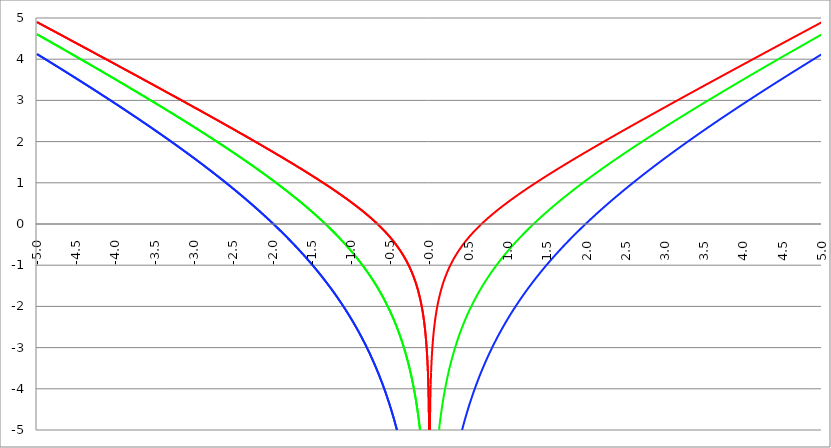
| Category | Series 1 | Series 0 | Series 2 |
|---|---|---|---|
| -5.0 | 4.9 | 4.605 | 4.124 |
| -4.995 | 4.895 | 4.6 | 4.119 |
| -4.99 | 4.89 | 4.594 | 4.113 |
| -4.985 | 4.885 | 4.589 | 4.107 |
| -4.98 | 4.88 | 4.584 | 4.101 |
| -4.975 | 4.875 | 4.578 | 4.095 |
| -4.97 | 4.87 | 4.573 | 4.089 |
| -4.965000000000001 | 4.865 | 4.567 | 4.084 |
| -4.960000000000001 | 4.86 | 4.562 | 4.078 |
| -4.955000000000001 | 4.854 | 4.557 | 4.072 |
| -4.950000000000001 | 4.849 | 4.551 | 4.066 |
| -4.945000000000001 | 4.844 | 4.546 | 4.06 |
| -4.940000000000001 | 4.839 | 4.54 | 4.054 |
| -4.935000000000001 | 4.834 | 4.535 | 4.049 |
| -4.930000000000001 | 4.829 | 4.53 | 4.043 |
| -4.925000000000002 | 4.824 | 4.524 | 4.037 |
| -4.920000000000002 | 4.819 | 4.519 | 4.031 |
| -4.915000000000002 | 4.814 | 4.513 | 4.025 |
| -4.910000000000002 | 4.809 | 4.508 | 4.019 |
| -4.905000000000002 | 4.803 | 4.503 | 4.013 |
| -4.900000000000002 | 4.798 | 4.497 | 4.008 |
| -4.895000000000002 | 4.793 | 4.492 | 4.002 |
| -4.890000000000002 | 4.788 | 4.486 | 3.996 |
| -4.885000000000002 | 4.783 | 4.481 | 3.99 |
| -4.880000000000002 | 4.778 | 4.476 | 3.984 |
| -4.875000000000003 | 4.773 | 4.47 | 3.978 |
| -4.870000000000003 | 4.768 | 4.465 | 3.972 |
| -4.865000000000003 | 4.763 | 4.459 | 3.966 |
| -4.860000000000003 | 4.757 | 4.454 | 3.961 |
| -4.855000000000003 | 4.752 | 4.449 | 3.955 |
| -4.850000000000003 | 4.747 | 4.443 | 3.949 |
| -4.845000000000003 | 4.742 | 4.438 | 3.943 |
| -4.840000000000003 | 4.737 | 4.432 | 3.937 |
| -4.835000000000003 | 4.732 | 4.427 | 3.931 |
| -4.830000000000004 | 4.727 | 4.422 | 3.925 |
| -4.825000000000004 | 4.722 | 4.416 | 3.919 |
| -4.820000000000004 | 4.717 | 4.411 | 3.914 |
| -4.815000000000004 | 4.712 | 4.405 | 3.908 |
| -4.810000000000004 | 4.706 | 4.4 | 3.902 |
| -4.805000000000004 | 4.701 | 4.394 | 3.896 |
| -4.800000000000004 | 4.696 | 4.389 | 3.89 |
| -4.795000000000004 | 4.691 | 4.384 | 3.884 |
| -4.790000000000004 | 4.686 | 4.378 | 3.878 |
| -4.785000000000004 | 4.681 | 4.373 | 3.872 |
| -4.780000000000004 | 4.676 | 4.367 | 3.866 |
| -4.775000000000004 | 4.671 | 4.362 | 3.86 |
| -4.770000000000004 | 4.666 | 4.357 | 3.855 |
| -4.765000000000005 | 4.66 | 4.351 | 3.849 |
| -4.760000000000005 | 4.655 | 4.346 | 3.843 |
| -4.755000000000005 | 4.65 | 4.34 | 3.837 |
| -4.750000000000005 | 4.645 | 4.335 | 3.831 |
| -4.745000000000005 | 4.64 | 4.329 | 3.825 |
| -4.740000000000005 | 4.635 | 4.324 | 3.819 |
| -4.735000000000005 | 4.63 | 4.319 | 3.813 |
| -4.730000000000005 | 4.625 | 4.313 | 3.807 |
| -4.725000000000006 | 4.62 | 4.308 | 3.801 |
| -4.720000000000006 | 4.614 | 4.302 | 3.795 |
| -4.715000000000006 | 4.609 | 4.297 | 3.789 |
| -4.710000000000006 | 4.604 | 4.291 | 3.784 |
| -4.705000000000006 | 4.599 | 4.286 | 3.778 |
| -4.700000000000006 | 4.594 | 4.281 | 3.772 |
| -4.695000000000006 | 4.589 | 4.275 | 3.766 |
| -4.690000000000006 | 4.584 | 4.27 | 3.76 |
| -4.685000000000007 | 4.579 | 4.264 | 3.754 |
| -4.680000000000007 | 4.574 | 4.259 | 3.748 |
| -4.675000000000007 | 4.568 | 4.253 | 3.742 |
| -4.670000000000007 | 4.563 | 4.248 | 3.736 |
| -4.665000000000007 | 4.558 | 4.243 | 3.73 |
| -4.660000000000007 | 4.553 | 4.237 | 3.724 |
| -4.655000000000007 | 4.548 | 4.232 | 3.718 |
| -4.650000000000007 | 4.543 | 4.226 | 3.712 |
| -4.645000000000007 | 4.538 | 4.221 | 3.706 |
| -4.640000000000008 | 4.533 | 4.215 | 3.7 |
| -4.635000000000008 | 4.528 | 4.21 | 3.694 |
| -4.630000000000008 | 4.522 | 4.204 | 3.688 |
| -4.625000000000008 | 4.517 | 4.199 | 3.682 |
| -4.620000000000008 | 4.512 | 4.194 | 3.677 |
| -4.615000000000008 | 4.507 | 4.188 | 3.671 |
| -4.610000000000008 | 4.502 | 4.183 | 3.665 |
| -4.605000000000008 | 4.497 | 4.177 | 3.659 |
| -4.600000000000008 | 4.492 | 4.172 | 3.653 |
| -4.595000000000009 | 4.487 | 4.166 | 3.647 |
| -4.590000000000009 | 4.481 | 4.161 | 3.641 |
| -4.585000000000009 | 4.476 | 4.155 | 3.635 |
| -4.580000000000009 | 4.471 | 4.15 | 3.629 |
| -4.57500000000001 | 4.466 | 4.144 | 3.623 |
| -4.57000000000001 | 4.461 | 4.139 | 3.617 |
| -4.565000000000009 | 4.456 | 4.134 | 3.611 |
| -4.560000000000009 | 4.451 | 4.128 | 3.605 |
| -4.555000000000009 | 4.446 | 4.123 | 3.599 |
| -4.55000000000001 | 4.441 | 4.117 | 3.593 |
| -4.54500000000001 | 4.435 | 4.112 | 3.587 |
| -4.54000000000001 | 4.43 | 4.106 | 3.581 |
| -4.53500000000001 | 4.425 | 4.101 | 3.575 |
| -4.53000000000001 | 4.42 | 4.095 | 3.569 |
| -4.52500000000001 | 4.415 | 4.09 | 3.563 |
| -4.52000000000001 | 4.41 | 4.084 | 3.557 |
| -4.51500000000001 | 4.405 | 4.079 | 3.551 |
| -4.51000000000001 | 4.4 | 4.073 | 3.545 |
| -4.505000000000011 | 4.394 | 4.068 | 3.539 |
| -4.500000000000011 | 4.389 | 4.062 | 3.533 |
| -4.495000000000011 | 4.384 | 4.057 | 3.527 |
| -4.490000000000011 | 4.379 | 4.052 | 3.521 |
| -4.485000000000011 | 4.374 | 4.046 | 3.515 |
| -4.480000000000011 | 4.369 | 4.041 | 3.509 |
| -4.475000000000011 | 4.364 | 4.035 | 3.503 |
| -4.470000000000011 | 4.359 | 4.03 | 3.497 |
| -4.465000000000011 | 4.353 | 4.024 | 3.491 |
| -4.460000000000011 | 4.348 | 4.019 | 3.485 |
| -4.455000000000012 | 4.343 | 4.013 | 3.479 |
| -4.450000000000012 | 4.338 | 4.008 | 3.473 |
| -4.445000000000012 | 4.333 | 4.002 | 3.467 |
| -4.440000000000012 | 4.328 | 3.997 | 3.461 |
| -4.435000000000012 | 4.323 | 3.991 | 3.455 |
| -4.430000000000012 | 4.318 | 3.986 | 3.449 |
| -4.425000000000012 | 4.312 | 3.98 | 3.443 |
| -4.420000000000012 | 4.307 | 3.975 | 3.436 |
| -4.415000000000012 | 4.302 | 3.969 | 3.43 |
| -4.410000000000013 | 4.297 | 3.964 | 3.424 |
| -4.405000000000013 | 4.292 | 3.958 | 3.418 |
| -4.400000000000013 | 4.287 | 3.953 | 3.412 |
| -4.395000000000013 | 4.282 | 3.947 | 3.406 |
| -4.390000000000013 | 4.277 | 3.942 | 3.4 |
| -4.385000000000013 | 4.271 | 3.936 | 3.394 |
| -4.380000000000013 | 4.266 | 3.931 | 3.388 |
| -4.375000000000013 | 4.261 | 3.925 | 3.382 |
| -4.370000000000013 | 4.256 | 3.92 | 3.376 |
| -4.365000000000013 | 4.251 | 3.914 | 3.37 |
| -4.360000000000014 | 4.246 | 3.909 | 3.364 |
| -4.355000000000014 | 4.241 | 3.903 | 3.358 |
| -4.350000000000014 | 4.236 | 3.898 | 3.352 |
| -4.345000000000014 | 4.23 | 3.892 | 3.346 |
| -4.340000000000014 | 4.225 | 3.887 | 3.34 |
| -4.335000000000014 | 4.22 | 3.881 | 3.333 |
| -4.330000000000014 | 4.215 | 3.876 | 3.327 |
| -4.325000000000014 | 4.21 | 3.87 | 3.321 |
| -4.320000000000014 | 4.205 | 3.865 | 3.315 |
| -4.315000000000015 | 4.2 | 3.859 | 3.309 |
| -4.310000000000015 | 4.195 | 3.854 | 3.303 |
| -4.305000000000015 | 4.189 | 3.848 | 3.297 |
| -4.300000000000015 | 4.184 | 3.843 | 3.291 |
| -4.295000000000015 | 4.179 | 3.837 | 3.285 |
| -4.290000000000015 | 4.174 | 3.832 | 3.279 |
| -4.285000000000015 | 4.169 | 3.826 | 3.273 |
| -4.280000000000015 | 4.164 | 3.821 | 3.266 |
| -4.275000000000015 | 4.159 | 3.815 | 3.26 |
| -4.270000000000015 | 4.153 | 3.81 | 3.254 |
| -4.265000000000016 | 4.148 | 3.804 | 3.248 |
| -4.260000000000016 | 4.143 | 3.799 | 3.242 |
| -4.255000000000016 | 4.138 | 3.793 | 3.236 |
| -4.250000000000016 | 4.133 | 3.788 | 3.23 |
| -4.245000000000016 | 4.128 | 3.782 | 3.224 |
| -4.240000000000016 | 4.123 | 3.777 | 3.217 |
| -4.235000000000016 | 4.117 | 3.771 | 3.211 |
| -4.230000000000016 | 4.112 | 3.765 | 3.205 |
| -4.225000000000017 | 4.107 | 3.76 | 3.199 |
| -4.220000000000017 | 4.102 | 3.754 | 3.193 |
| -4.215000000000017 | 4.097 | 3.749 | 3.187 |
| -4.210000000000017 | 4.092 | 3.743 | 3.181 |
| -4.205000000000017 | 4.087 | 3.738 | 3.175 |
| -4.200000000000017 | 4.082 | 3.732 | 3.168 |
| -4.195000000000017 | 4.076 | 3.727 | 3.162 |
| -4.190000000000017 | 4.071 | 3.721 | 3.156 |
| -4.185000000000017 | 4.066 | 3.716 | 3.15 |
| -4.180000000000017 | 4.061 | 3.71 | 3.144 |
| -4.175000000000018 | 4.056 | 3.705 | 3.138 |
| -4.170000000000018 | 4.051 | 3.699 | 3.131 |
| -4.165000000000018 | 4.046 | 3.693 | 3.125 |
| -4.160000000000018 | 4.04 | 3.688 | 3.119 |
| -4.155000000000018 | 4.035 | 3.682 | 3.113 |
| -4.150000000000018 | 4.03 | 3.677 | 3.107 |
| -4.145000000000018 | 4.025 | 3.671 | 3.101 |
| -4.140000000000018 | 4.02 | 3.666 | 3.094 |
| -4.135000000000018 | 4.015 | 3.66 | 3.088 |
| -4.130000000000019 | 4.01 | 3.655 | 3.082 |
| -4.125000000000019 | 4.004 | 3.649 | 3.076 |
| -4.120000000000019 | 3.999 | 3.643 | 3.07 |
| -4.115000000000019 | 3.994 | 3.638 | 3.064 |
| -4.110000000000019 | 3.989 | 3.632 | 3.057 |
| -4.105000000000019 | 3.984 | 3.627 | 3.051 |
| -4.100000000000019 | 3.979 | 3.621 | 3.045 |
| -4.095000000000019 | 3.973 | 3.616 | 3.039 |
| -4.090000000000019 | 3.968 | 3.61 | 3.033 |
| -4.085000000000019 | 3.963 | 3.605 | 3.026 |
| -4.08000000000002 | 3.958 | 3.599 | 3.02 |
| -4.07500000000002 | 3.953 | 3.593 | 3.014 |
| -4.07000000000002 | 3.948 | 3.588 | 3.008 |
| -4.06500000000002 | 3.943 | 3.582 | 3.002 |
| -4.06000000000002 | 3.937 | 3.577 | 2.995 |
| -4.05500000000002 | 3.932 | 3.571 | 2.989 |
| -4.05000000000002 | 3.927 | 3.566 | 2.983 |
| -4.04500000000002 | 3.922 | 3.56 | 2.977 |
| -4.04000000000002 | 3.917 | 3.554 | 2.97 |
| -4.03500000000002 | 3.912 | 3.549 | 2.964 |
| -4.03000000000002 | 3.907 | 3.543 | 2.958 |
| -4.025000000000021 | 3.901 | 3.538 | 2.952 |
| -4.020000000000021 | 3.896 | 3.532 | 2.946 |
| -4.015000000000021 | 3.891 | 3.526 | 2.939 |
| -4.010000000000021 | 3.886 | 3.521 | 2.933 |
| -4.005000000000021 | 3.881 | 3.515 | 2.927 |
| -4.000000000000021 | 3.876 | 3.51 | 2.921 |
| -3.995000000000021 | 3.87 | 3.504 | 2.914 |
| -3.990000000000021 | 3.865 | 3.499 | 2.908 |
| -3.985000000000022 | 3.86 | 3.493 | 2.902 |
| -3.980000000000022 | 3.855 | 3.487 | 2.896 |
| -3.975000000000022 | 3.85 | 3.482 | 2.889 |
| -3.970000000000022 | 3.845 | 3.476 | 2.883 |
| -3.965000000000022 | 3.84 | 3.471 | 2.877 |
| -3.960000000000022 | 3.834 | 3.465 | 2.87 |
| -3.955000000000022 | 3.829 | 3.459 | 2.864 |
| -3.950000000000022 | 3.824 | 3.454 | 2.858 |
| -3.945000000000022 | 3.819 | 3.448 | 2.852 |
| -3.940000000000023 | 3.814 | 3.443 | 2.845 |
| -3.935000000000023 | 3.809 | 3.437 | 2.839 |
| -3.930000000000023 | 3.803 | 3.431 | 2.833 |
| -3.925000000000023 | 3.798 | 3.426 | 2.826 |
| -3.920000000000023 | 3.793 | 3.42 | 2.82 |
| -3.915000000000023 | 3.788 | 3.414 | 2.814 |
| -3.910000000000023 | 3.783 | 3.409 | 2.808 |
| -3.905000000000023 | 3.778 | 3.403 | 2.801 |
| -3.900000000000023 | 3.772 | 3.398 | 2.795 |
| -3.895000000000023 | 3.767 | 3.392 | 2.789 |
| -3.890000000000024 | 3.762 | 3.386 | 2.782 |
| -3.885000000000024 | 3.757 | 3.381 | 2.776 |
| -3.880000000000024 | 3.752 | 3.375 | 2.77 |
| -3.875000000000024 | 3.747 | 3.37 | 2.763 |
| -3.870000000000024 | 3.742 | 3.364 | 2.757 |
| -3.865000000000024 | 3.736 | 3.358 | 2.751 |
| -3.860000000000024 | 3.731 | 3.353 | 2.744 |
| -3.855000000000024 | 3.726 | 3.347 | 2.738 |
| -3.850000000000024 | 3.721 | 3.341 | 2.732 |
| -3.845000000000025 | 3.716 | 3.336 | 2.725 |
| -3.840000000000025 | 3.711 | 3.33 | 2.719 |
| -3.835000000000025 | 3.705 | 3.324 | 2.713 |
| -3.830000000000025 | 3.7 | 3.319 | 2.706 |
| -3.825000000000025 | 3.695 | 3.313 | 2.7 |
| -3.820000000000025 | 3.69 | 3.308 | 2.694 |
| -3.815000000000025 | 3.685 | 3.302 | 2.687 |
| -3.810000000000025 | 3.68 | 3.296 | 2.681 |
| -3.805000000000025 | 3.674 | 3.291 | 2.675 |
| -3.800000000000026 | 3.669 | 3.285 | 2.668 |
| -3.795000000000026 | 3.664 | 3.279 | 2.662 |
| -3.790000000000026 | 3.659 | 3.274 | 2.655 |
| -3.785000000000026 | 3.654 | 3.268 | 2.649 |
| -3.780000000000026 | 3.648 | 3.262 | 2.643 |
| -3.775000000000026 | 3.643 | 3.257 | 2.636 |
| -3.770000000000026 | 3.638 | 3.251 | 2.63 |
| -3.765000000000026 | 3.633 | 3.245 | 2.624 |
| -3.760000000000026 | 3.628 | 3.24 | 2.617 |
| -3.755000000000026 | 3.623 | 3.234 | 2.611 |
| -3.750000000000027 | 3.617 | 3.228 | 2.604 |
| -3.745000000000027 | 3.612 | 3.223 | 2.598 |
| -3.740000000000027 | 3.607 | 3.217 | 2.592 |
| -3.735000000000027 | 3.602 | 3.211 | 2.585 |
| -3.730000000000027 | 3.597 | 3.206 | 2.579 |
| -3.725000000000027 | 3.592 | 3.2 | 2.572 |
| -3.720000000000027 | 3.586 | 3.194 | 2.566 |
| -3.715000000000027 | 3.581 | 3.189 | 2.559 |
| -3.710000000000027 | 3.576 | 3.183 | 2.553 |
| -3.705000000000028 | 3.571 | 3.177 | 2.547 |
| -3.700000000000028 | 3.566 | 3.172 | 2.54 |
| -3.695000000000028 | 3.56 | 3.166 | 2.534 |
| -3.690000000000028 | 3.555 | 3.16 | 2.527 |
| -3.685000000000028 | 3.55 | 3.155 | 2.521 |
| -3.680000000000028 | 3.545 | 3.149 | 2.514 |
| -3.675000000000028 | 3.54 | 3.143 | 2.508 |
| -3.670000000000028 | 3.535 | 3.137 | 2.501 |
| -3.665000000000028 | 3.529 | 3.132 | 2.495 |
| -3.660000000000028 | 3.524 | 3.126 | 2.489 |
| -3.655000000000029 | 3.519 | 3.12 | 2.482 |
| -3.650000000000029 | 3.514 | 3.115 | 2.476 |
| -3.645000000000029 | 3.509 | 3.109 | 2.469 |
| -3.640000000000029 | 3.503 | 3.103 | 2.463 |
| -3.635000000000029 | 3.498 | 3.098 | 2.456 |
| -3.630000000000029 | 3.493 | 3.092 | 2.45 |
| -3.625000000000029 | 3.488 | 3.086 | 2.443 |
| -3.620000000000029 | 3.483 | 3.08 | 2.437 |
| -3.615000000000029 | 3.478 | 3.075 | 2.43 |
| -3.61000000000003 | 3.472 | 3.069 | 2.424 |
| -3.60500000000003 | 3.467 | 3.063 | 2.417 |
| -3.60000000000003 | 3.462 | 3.058 | 2.411 |
| -3.59500000000003 | 3.457 | 3.052 | 2.404 |
| -3.59000000000003 | 3.452 | 3.046 | 2.398 |
| -3.58500000000003 | 3.446 | 3.04 | 2.391 |
| -3.58000000000003 | 3.441 | 3.035 | 2.385 |
| -3.57500000000003 | 3.436 | 3.029 | 2.378 |
| -3.57000000000003 | 3.431 | 3.023 | 2.372 |
| -3.565000000000031 | 3.426 | 3.017 | 2.365 |
| -3.560000000000031 | 3.42 | 3.012 | 2.359 |
| -3.555000000000031 | 3.415 | 3.006 | 2.352 |
| -3.550000000000031 | 3.41 | 3 | 2.345 |
| -3.545000000000031 | 3.405 | 2.995 | 2.339 |
| -3.540000000000031 | 3.4 | 2.989 | 2.332 |
| -3.535000000000031 | 3.394 | 2.983 | 2.326 |
| -3.530000000000031 | 3.389 | 2.977 | 2.319 |
| -3.525000000000031 | 3.384 | 2.972 | 2.313 |
| -3.520000000000032 | 3.379 | 2.966 | 2.306 |
| -3.515000000000032 | 3.374 | 2.96 | 2.299 |
| -3.510000000000032 | 3.368 | 2.954 | 2.293 |
| -3.505000000000032 | 3.363 | 2.949 | 2.286 |
| -3.500000000000032 | 3.358 | 2.943 | 2.28 |
| -3.495000000000032 | 3.353 | 2.937 | 2.273 |
| -3.490000000000032 | 3.348 | 2.931 | 2.267 |
| -3.485000000000032 | 3.342 | 2.926 | 2.26 |
| -3.480000000000032 | 3.337 | 2.92 | 2.253 |
| -3.475000000000032 | 3.332 | 2.914 | 2.247 |
| -3.470000000000033 | 3.327 | 2.908 | 2.24 |
| -3.465000000000033 | 3.322 | 2.902 | 2.234 |
| -3.460000000000033 | 3.316 | 2.897 | 2.227 |
| -3.455000000000033 | 3.311 | 2.891 | 2.22 |
| -3.450000000000033 | 3.306 | 2.885 | 2.214 |
| -3.445000000000033 | 3.301 | 2.879 | 2.207 |
| -3.440000000000033 | 3.296 | 2.874 | 2.2 |
| -3.435000000000033 | 3.29 | 2.868 | 2.194 |
| -3.430000000000033 | 3.285 | 2.862 | 2.187 |
| -3.425000000000034 | 3.28 | 2.856 | 2.181 |
| -3.420000000000034 | 3.275 | 2.85 | 2.174 |
| -3.415000000000034 | 3.27 | 2.845 | 2.167 |
| -3.410000000000034 | 3.264 | 2.839 | 2.161 |
| -3.405000000000034 | 3.259 | 2.833 | 2.154 |
| -3.400000000000034 | 3.254 | 2.827 | 2.147 |
| -3.395000000000034 | 3.249 | 2.821 | 2.141 |
| -3.390000000000034 | 3.244 | 2.816 | 2.134 |
| -3.385000000000034 | 3.238 | 2.81 | 2.127 |
| -3.380000000000034 | 3.233 | 2.804 | 2.121 |
| -3.375000000000035 | 3.228 | 2.798 | 2.114 |
| -3.370000000000035 | 3.223 | 2.792 | 2.107 |
| -3.365000000000035 | 3.217 | 2.787 | 2.1 |
| -3.360000000000035 | 3.212 | 2.781 | 2.094 |
| -3.355000000000035 | 3.207 | 2.775 | 2.087 |
| -3.350000000000035 | 3.202 | 2.769 | 2.08 |
| -3.345000000000035 | 3.197 | 2.763 | 2.074 |
| -3.340000000000035 | 3.191 | 2.757 | 2.067 |
| -3.335000000000035 | 3.186 | 2.752 | 2.06 |
| -3.330000000000036 | 3.181 | 2.746 | 2.053 |
| -3.325000000000036 | 3.176 | 2.74 | 2.047 |
| -3.320000000000036 | 3.171 | 2.734 | 2.04 |
| -3.315000000000036 | 3.165 | 2.728 | 2.033 |
| -3.310000000000036 | 3.16 | 2.722 | 2.026 |
| -3.305000000000036 | 3.155 | 2.717 | 2.02 |
| -3.300000000000036 | 3.15 | 2.711 | 2.013 |
| -3.295000000000036 | 3.144 | 2.705 | 2.006 |
| -3.290000000000036 | 3.139 | 2.699 | 1.999 |
| -3.285000000000036 | 3.134 | 2.693 | 1.993 |
| -3.280000000000036 | 3.129 | 2.687 | 1.986 |
| -3.275000000000037 | 3.123 | 2.681 | 1.979 |
| -3.270000000000037 | 3.118 | 2.676 | 1.972 |
| -3.265000000000037 | 3.113 | 2.67 | 1.966 |
| -3.260000000000037 | 3.108 | 2.664 | 1.959 |
| -3.255000000000037 | 3.103 | 2.658 | 1.952 |
| -3.250000000000037 | 3.097 | 2.652 | 1.945 |
| -3.245000000000037 | 3.092 | 2.646 | 1.938 |
| -3.240000000000037 | 3.087 | 2.64 | 1.932 |
| -3.235000000000038 | 3.082 | 2.635 | 1.925 |
| -3.230000000000038 | 3.076 | 2.629 | 1.918 |
| -3.225000000000038 | 3.071 | 2.623 | 1.911 |
| -3.220000000000038 | 3.066 | 2.617 | 1.904 |
| -3.215000000000038 | 3.061 | 2.611 | 1.897 |
| -3.210000000000038 | 3.055 | 2.605 | 1.891 |
| -3.205000000000038 | 3.05 | 2.599 | 1.884 |
| -3.200000000000038 | 3.045 | 2.593 | 1.877 |
| -3.195000000000038 | 3.04 | 2.587 | 1.87 |
| -3.190000000000039 | 3.035 | 2.582 | 1.863 |
| -3.185000000000039 | 3.029 | 2.576 | 1.856 |
| -3.180000000000039 | 3.024 | 2.57 | 1.849 |
| -3.175000000000039 | 3.019 | 2.564 | 1.843 |
| -3.170000000000039 | 3.014 | 2.558 | 1.836 |
| -3.16500000000004 | 3.008 | 2.552 | 1.829 |
| -3.16000000000004 | 3.003 | 2.546 | 1.822 |
| -3.155000000000039 | 2.998 | 2.54 | 1.815 |
| -3.150000000000039 | 2.993 | 2.534 | 1.808 |
| -3.14500000000004 | 2.987 | 2.528 | 1.801 |
| -3.14000000000004 | 2.982 | 2.522 | 1.794 |
| -3.13500000000004 | 2.977 | 2.516 | 1.787 |
| -3.13000000000004 | 2.972 | 2.51 | 1.78 |
| -3.12500000000004 | 2.966 | 2.505 | 1.774 |
| -3.12000000000004 | 2.961 | 2.499 | 1.767 |
| -3.11500000000004 | 2.956 | 2.493 | 1.76 |
| -3.11000000000004 | 2.951 | 2.487 | 1.753 |
| -3.10500000000004 | 2.945 | 2.481 | 1.746 |
| -3.10000000000004 | 2.94 | 2.475 | 1.739 |
| -3.095000000000041 | 2.935 | 2.469 | 1.732 |
| -3.090000000000041 | 2.93 | 2.463 | 1.725 |
| -3.085000000000041 | 2.924 | 2.457 | 1.718 |
| -3.080000000000041 | 2.919 | 2.451 | 1.711 |
| -3.075000000000041 | 2.914 | 2.445 | 1.704 |
| -3.070000000000041 | 2.909 | 2.439 | 1.697 |
| -3.065000000000041 | 2.903 | 2.433 | 1.69 |
| -3.060000000000041 | 2.898 | 2.427 | 1.683 |
| -3.055000000000041 | 2.893 | 2.421 | 1.676 |
| -3.050000000000042 | 2.887 | 2.415 | 1.669 |
| -3.045000000000042 | 2.882 | 2.409 | 1.662 |
| -3.040000000000042 | 2.877 | 2.403 | 1.655 |
| -3.035000000000042 | 2.872 | 2.397 | 1.648 |
| -3.030000000000042 | 2.866 | 2.391 | 1.641 |
| -3.025000000000042 | 2.861 | 2.385 | 1.634 |
| -3.020000000000042 | 2.856 | 2.379 | 1.627 |
| -3.015000000000042 | 2.851 | 2.373 | 1.62 |
| -3.010000000000042 | 2.845 | 2.367 | 1.613 |
| -3.005000000000043 | 2.84 | 2.361 | 1.606 |
| -3.000000000000043 | 2.835 | 2.355 | 1.599 |
| -2.995000000000043 | 2.83 | 2.349 | 1.591 |
| -2.990000000000043 | 2.824 | 2.343 | 1.584 |
| -2.985000000000043 | 2.819 | 2.337 | 1.577 |
| -2.980000000000043 | 2.814 | 2.331 | 1.57 |
| -2.975000000000043 | 2.808 | 2.325 | 1.563 |
| -2.970000000000043 | 2.803 | 2.319 | 1.556 |
| -2.965000000000043 | 2.798 | 2.313 | 1.549 |
| -2.960000000000043 | 2.793 | 2.307 | 1.542 |
| -2.955000000000044 | 2.787 | 2.301 | 1.535 |
| -2.950000000000044 | 2.782 | 2.295 | 1.528 |
| -2.945000000000044 | 2.777 | 2.289 | 1.52 |
| -2.940000000000044 | 2.772 | 2.283 | 1.513 |
| -2.935000000000044 | 2.766 | 2.277 | 1.506 |
| -2.930000000000044 | 2.761 | 2.271 | 1.499 |
| -2.925000000000044 | 2.756 | 2.265 | 1.492 |
| -2.920000000000044 | 2.75 | 2.259 | 1.485 |
| -2.915000000000044 | 2.745 | 2.253 | 1.477 |
| -2.910000000000045 | 2.74 | 2.247 | 1.47 |
| -2.905000000000045 | 2.735 | 2.241 | 1.463 |
| -2.900000000000045 | 2.729 | 2.234 | 1.456 |
| -2.895000000000045 | 2.724 | 2.228 | 1.449 |
| -2.890000000000045 | 2.719 | 2.222 | 1.441 |
| -2.885000000000045 | 2.713 | 2.216 | 1.434 |
| -2.880000000000045 | 2.708 | 2.21 | 1.427 |
| -2.875000000000045 | 2.703 | 2.204 | 1.42 |
| -2.870000000000045 | 2.697 | 2.198 | 1.413 |
| -2.865000000000045 | 2.692 | 2.192 | 1.405 |
| -2.860000000000046 | 2.687 | 2.186 | 1.398 |
| -2.855000000000046 | 2.682 | 2.18 | 1.391 |
| -2.850000000000046 | 2.676 | 2.174 | 1.384 |
| -2.845000000000046 | 2.671 | 2.167 | 1.376 |
| -2.840000000000046 | 2.666 | 2.161 | 1.369 |
| -2.835000000000046 | 2.66 | 2.155 | 1.362 |
| -2.830000000000046 | 2.655 | 2.149 | 1.355 |
| -2.825000000000046 | 2.65 | 2.143 | 1.347 |
| -2.820000000000046 | 2.644 | 2.137 | 1.34 |
| -2.815000000000047 | 2.639 | 2.131 | 1.333 |
| -2.810000000000047 | 2.634 | 2.125 | 1.325 |
| -2.805000000000047 | 2.629 | 2.118 | 1.318 |
| -2.800000000000047 | 2.623 | 2.112 | 1.311 |
| -2.795000000000047 | 2.618 | 2.106 | 1.303 |
| -2.790000000000047 | 2.613 | 2.1 | 1.296 |
| -2.785000000000047 | 2.607 | 2.094 | 1.289 |
| -2.780000000000047 | 2.602 | 2.088 | 1.281 |
| -2.775000000000047 | 2.597 | 2.081 | 1.274 |
| -2.770000000000047 | 2.591 | 2.075 | 1.267 |
| -2.765000000000048 | 2.586 | 2.069 | 1.259 |
| -2.760000000000048 | 2.581 | 2.063 | 1.252 |
| -2.755000000000048 | 2.575 | 2.057 | 1.244 |
| -2.750000000000048 | 2.57 | 2.051 | 1.237 |
| -2.745000000000048 | 2.565 | 2.044 | 1.23 |
| -2.740000000000048 | 2.559 | 2.038 | 1.222 |
| -2.735000000000048 | 2.554 | 2.032 | 1.215 |
| -2.730000000000048 | 2.549 | 2.026 | 1.207 |
| -2.725000000000048 | 2.543 | 2.02 | 1.2 |
| -2.720000000000049 | 2.538 | 2.013 | 1.193 |
| -2.715000000000049 | 2.533 | 2.007 | 1.185 |
| -2.710000000000049 | 2.528 | 2.001 | 1.178 |
| -2.705000000000049 | 2.522 | 1.995 | 1.17 |
| -2.700000000000049 | 2.517 | 1.989 | 1.163 |
| -2.695000000000049 | 2.512 | 1.982 | 1.155 |
| -2.690000000000049 | 2.506 | 1.976 | 1.148 |
| -2.685000000000049 | 2.501 | 1.97 | 1.14 |
| -2.680000000000049 | 2.496 | 1.964 | 1.133 |
| -2.675000000000049 | 2.49 | 1.957 | 1.125 |
| -2.67000000000005 | 2.485 | 1.951 | 1.118 |
| -2.66500000000005 | 2.479 | 1.945 | 1.11 |
| -2.66000000000005 | 2.474 | 1.939 | 1.103 |
| -2.65500000000005 | 2.469 | 1.932 | 1.095 |
| -2.65000000000005 | 2.463 | 1.926 | 1.088 |
| -2.64500000000005 | 2.458 | 1.92 | 1.08 |
| -2.64000000000005 | 2.453 | 1.914 | 1.072 |
| -2.63500000000005 | 2.447 | 1.907 | 1.065 |
| -2.63000000000005 | 2.442 | 1.901 | 1.057 |
| -2.625000000000051 | 2.437 | 1.895 | 1.05 |
| -2.620000000000051 | 2.431 | 1.889 | 1.042 |
| -2.615000000000051 | 2.426 | 1.882 | 1.034 |
| -2.610000000000051 | 2.421 | 1.876 | 1.027 |
| -2.605000000000051 | 2.415 | 1.87 | 1.019 |
| -2.600000000000051 | 2.41 | 1.863 | 1.012 |
| -2.595000000000051 | 2.405 | 1.857 | 1.004 |
| -2.590000000000051 | 2.399 | 1.851 | 0.996 |
| -2.585000000000051 | 2.394 | 1.844 | 0.989 |
| -2.580000000000052 | 2.389 | 1.838 | 0.981 |
| -2.575000000000052 | 2.383 | 1.832 | 0.973 |
| -2.570000000000052 | 2.378 | 1.825 | 0.966 |
| -2.565000000000052 | 2.372 | 1.819 | 0.958 |
| -2.560000000000052 | 2.367 | 1.813 | 0.95 |
| -2.555000000000052 | 2.362 | 1.806 | 0.943 |
| -2.550000000000052 | 2.356 | 1.8 | 0.935 |
| -2.545000000000052 | 2.351 | 1.794 | 0.927 |
| -2.540000000000052 | 2.346 | 1.787 | 0.919 |
| -2.535000000000053 | 2.34 | 1.781 | 0.912 |
| -2.530000000000053 | 2.335 | 1.775 | 0.904 |
| -2.525000000000053 | 2.329 | 1.768 | 0.896 |
| -2.520000000000053 | 2.324 | 1.762 | 0.888 |
| -2.515000000000053 | 2.319 | 1.755 | 0.881 |
| -2.510000000000053 | 2.313 | 1.749 | 0.873 |
| -2.505000000000053 | 2.308 | 1.743 | 0.865 |
| -2.500000000000053 | 2.303 | 1.736 | 0.857 |
| -2.495000000000053 | 2.297 | 1.73 | 0.849 |
| -2.490000000000053 | 2.292 | 1.723 | 0.842 |
| -2.485000000000054 | 2.286 | 1.717 | 0.834 |
| -2.480000000000054 | 2.281 | 1.711 | 0.826 |
| -2.475000000000054 | 2.276 | 1.704 | 0.818 |
| -2.470000000000054 | 2.27 | 1.698 | 0.81 |
| -2.465000000000054 | 2.265 | 1.691 | 0.802 |
| -2.460000000000054 | 2.259 | 1.685 | 0.794 |
| -2.455000000000054 | 2.254 | 1.678 | 0.787 |
| -2.450000000000054 | 2.249 | 1.672 | 0.779 |
| -2.445000000000054 | 2.243 | 1.665 | 0.771 |
| -2.440000000000055 | 2.238 | 1.659 | 0.763 |
| -2.435000000000055 | 2.232 | 1.653 | 0.755 |
| -2.430000000000055 | 2.227 | 1.646 | 0.747 |
| -2.425000000000055 | 2.222 | 1.64 | 0.739 |
| -2.420000000000055 | 2.216 | 1.633 | 0.731 |
| -2.415000000000055 | 2.211 | 1.627 | 0.723 |
| -2.410000000000055 | 2.205 | 1.62 | 0.715 |
| -2.405000000000055 | 2.2 | 1.614 | 0.707 |
| -2.400000000000055 | 2.195 | 1.607 | 0.699 |
| -2.395000000000055 | 2.189 | 1.601 | 0.691 |
| -2.390000000000056 | 2.184 | 1.594 | 0.683 |
| -2.385000000000056 | 2.178 | 1.588 | 0.675 |
| -2.380000000000056 | 2.173 | 1.581 | 0.667 |
| -2.375000000000056 | 2.167 | 1.575 | 0.659 |
| -2.370000000000056 | 2.162 | 1.568 | 0.651 |
| -2.365000000000056 | 2.157 | 1.561 | 0.643 |
| -2.360000000000056 | 2.151 | 1.555 | 0.635 |
| -2.355000000000056 | 2.146 | 1.548 | 0.627 |
| -2.350000000000056 | 2.14 | 1.542 | 0.619 |
| -2.345000000000057 | 2.135 | 1.535 | 0.61 |
| -2.340000000000057 | 2.129 | 1.529 | 0.602 |
| -2.335000000000057 | 2.124 | 1.522 | 0.594 |
| -2.330000000000057 | 2.119 | 1.515 | 0.586 |
| -2.325000000000057 | 2.113 | 1.509 | 0.578 |
| -2.320000000000057 | 2.108 | 1.502 | 0.57 |
| -2.315000000000057 | 2.102 | 1.496 | 0.562 |
| -2.310000000000057 | 2.097 | 1.489 | 0.553 |
| -2.305000000000057 | 2.091 | 1.482 | 0.545 |
| -2.300000000000058 | 2.086 | 1.476 | 0.537 |
| -2.295000000000058 | 2.08 | 1.469 | 0.529 |
| -2.290000000000058 | 2.075 | 1.463 | 0.52 |
| -2.285000000000058 | 2.069 | 1.456 | 0.512 |
| -2.280000000000058 | 2.064 | 1.449 | 0.504 |
| -2.275000000000058 | 2.059 | 1.443 | 0.496 |
| -2.270000000000058 | 2.053 | 1.436 | 0.487 |
| -2.265000000000058 | 2.048 | 1.429 | 0.479 |
| -2.260000000000058 | 2.042 | 1.423 | 0.471 |
| -2.255000000000058 | 2.037 | 1.416 | 0.462 |
| -2.250000000000059 | 2.031 | 1.409 | 0.454 |
| -2.245000000000059 | 2.026 | 1.403 | 0.446 |
| -2.240000000000059 | 2.02 | 1.396 | 0.437 |
| -2.235000000000059 | 2.015 | 1.389 | 0.429 |
| -2.23000000000006 | 2.009 | 1.382 | 0.421 |
| -2.22500000000006 | 2.004 | 1.376 | 0.412 |
| -2.22000000000006 | 1.998 | 1.369 | 0.404 |
| -2.215000000000059 | 1.993 | 1.362 | 0.396 |
| -2.210000000000059 | 1.987 | 1.355 | 0.387 |
| -2.20500000000006 | 1.982 | 1.349 | 0.379 |
| -2.20000000000006 | 1.976 | 1.342 | 0.37 |
| -2.19500000000006 | 1.971 | 1.335 | 0.362 |
| -2.19000000000006 | 1.965 | 1.328 | 0.353 |
| -2.18500000000006 | 1.96 | 1.322 | 0.345 |
| -2.18000000000006 | 1.954 | 1.315 | 0.336 |
| -2.17500000000006 | 1.949 | 1.308 | 0.328 |
| -2.17000000000006 | 1.943 | 1.301 | 0.319 |
| -2.16500000000006 | 1.938 | 1.295 | 0.311 |
| -2.160000000000061 | 1.932 | 1.288 | 0.302 |
| -2.155000000000061 | 1.927 | 1.281 | 0.294 |
| -2.150000000000061 | 1.921 | 1.274 | 0.285 |
| -2.145000000000061 | 1.916 | 1.267 | 0.276 |
| -2.140000000000061 | 1.91 | 1.26 | 0.268 |
| -2.135000000000061 | 1.905 | 1.254 | 0.259 |
| -2.130000000000061 | 1.899 | 1.247 | 0.251 |
| -2.125000000000061 | 1.894 | 1.24 | 0.242 |
| -2.120000000000061 | 1.888 | 1.233 | 0.233 |
| -2.115000000000061 | 1.883 | 1.226 | 0.225 |
| -2.110000000000062 | 1.877 | 1.219 | 0.216 |
| -2.105000000000062 | 1.872 | 1.212 | 0.207 |
| -2.100000000000062 | 1.866 | 1.205 | 0.199 |
| -2.095000000000062 | 1.861 | 1.198 | 0.19 |
| -2.090000000000062 | 1.855 | 1.192 | 0.181 |
| -2.085000000000062 | 1.85 | 1.185 | 0.172 |
| -2.080000000000062 | 1.844 | 1.178 | 0.164 |
| -2.075000000000062 | 1.838 | 1.171 | 0.155 |
| -2.070000000000062 | 1.833 | 1.164 | 0.146 |
| -2.065000000000063 | 1.827 | 1.157 | 0.137 |
| -2.060000000000063 | 1.822 | 1.15 | 0.128 |
| -2.055000000000063 | 1.816 | 1.143 | 0.119 |
| -2.050000000000063 | 1.811 | 1.136 | 0.111 |
| -2.045000000000063 | 1.805 | 1.129 | 0.102 |
| -2.040000000000063 | 1.799 | 1.122 | 0.093 |
| -2.035000000000063 | 1.794 | 1.115 | 0.084 |
| -2.030000000000063 | 1.788 | 1.108 | 0.075 |
| -2.025000000000063 | 1.783 | 1.101 | 0.066 |
| -2.020000000000064 | 1.777 | 1.094 | 0.057 |
| -2.015000000000064 | 1.772 | 1.087 | 0.048 |
| -2.010000000000064 | 1.766 | 1.08 | 0.039 |
| -2.005000000000064 | 1.76 | 1.073 | 0.03 |
| -2.000000000000064 | 1.755 | 1.066 | 0.021 |
| -1.995000000000064 | 1.749 | 1.059 | 0.012 |
| -1.990000000000064 | 1.744 | 1.052 | 0.003 |
| -1.985000000000064 | 1.738 | 1.044 | -0.006 |
| -1.980000000000064 | 1.732 | 1.037 | -0.015 |
| -1.975000000000064 | 1.727 | 1.03 | -0.024 |
| -1.970000000000065 | 1.721 | 1.023 | -0.033 |
| -1.965000000000065 | 1.716 | 1.016 | -0.042 |
| -1.960000000000065 | 1.71 | 1.009 | -0.051 |
| -1.955000000000065 | 1.704 | 1.002 | -0.061 |
| -1.950000000000065 | 1.699 | 0.995 | -0.07 |
| -1.945000000000065 | 1.693 | 0.987 | -0.079 |
| -1.940000000000065 | 1.688 | 0.98 | -0.088 |
| -1.935000000000065 | 1.682 | 0.973 | -0.097 |
| -1.930000000000065 | 1.676 | 0.966 | -0.107 |
| -1.925000000000066 | 1.671 | 0.959 | -0.116 |
| -1.920000000000066 | 1.665 | 0.951 | -0.125 |
| -1.915000000000066 | 1.659 | 0.944 | -0.134 |
| -1.910000000000066 | 1.654 | 0.937 | -0.144 |
| -1.905000000000066 | 1.648 | 0.93 | -0.153 |
| -1.900000000000066 | 1.642 | 0.922 | -0.162 |
| -1.895000000000066 | 1.637 | 0.915 | -0.172 |
| -1.890000000000066 | 1.631 | 0.908 | -0.181 |
| -1.885000000000066 | 1.626 | 0.901 | -0.19 |
| -1.880000000000066 | 1.62 | 0.893 | -0.2 |
| -1.875000000000067 | 1.614 | 0.886 | -0.209 |
| -1.870000000000067 | 1.609 | 0.879 | -0.219 |
| -1.865000000000067 | 1.603 | 0.871 | -0.228 |
| -1.860000000000067 | 1.597 | 0.864 | -0.238 |
| -1.855000000000067 | 1.591 | 0.857 | -0.247 |
| -1.850000000000067 | 1.586 | 0.849 | -0.257 |
| -1.845000000000067 | 1.58 | 0.842 | -0.266 |
| -1.840000000000067 | 1.574 | 0.835 | -0.276 |
| -1.835000000000067 | 1.569 | 0.827 | -0.285 |
| -1.830000000000068 | 1.563 | 0.82 | -0.295 |
| -1.825000000000068 | 1.557 | 0.812 | -0.304 |
| -1.820000000000068 | 1.552 | 0.805 | -0.314 |
| -1.815000000000068 | 1.546 | 0.797 | -0.324 |
| -1.810000000000068 | 1.54 | 0.79 | -0.333 |
| -1.805000000000068 | 1.535 | 0.783 | -0.343 |
| -1.800000000000068 | 1.529 | 0.775 | -0.353 |
| -1.795000000000068 | 1.523 | 0.768 | -0.363 |
| -1.790000000000068 | 1.517 | 0.76 | -0.372 |
| -1.785000000000068 | 1.512 | 0.753 | -0.382 |
| -1.780000000000069 | 1.506 | 0.745 | -0.392 |
| -1.775000000000069 | 1.5 | 0.738 | -0.402 |
| -1.770000000000069 | 1.494 | 0.73 | -0.411 |
| -1.765000000000069 | 1.489 | 0.723 | -0.421 |
| -1.760000000000069 | 1.483 | 0.715 | -0.431 |
| -1.75500000000007 | 1.477 | 0.707 | -0.441 |
| -1.75000000000007 | 1.471 | 0.7 | -0.451 |
| -1.745000000000069 | 1.466 | 0.692 | -0.461 |
| -1.740000000000069 | 1.46 | 0.685 | -0.471 |
| -1.73500000000007 | 1.454 | 0.677 | -0.481 |
| -1.73000000000007 | 1.448 | 0.669 | -0.491 |
| -1.72500000000007 | 1.443 | 0.662 | -0.501 |
| -1.72000000000007 | 1.437 | 0.654 | -0.511 |
| -1.71500000000007 | 1.431 | 0.646 | -0.521 |
| -1.71000000000007 | 1.425 | 0.639 | -0.531 |
| -1.70500000000007 | 1.419 | 0.631 | -0.541 |
| -1.70000000000007 | 1.414 | 0.623 | -0.551 |
| -1.69500000000007 | 1.408 | 0.616 | -0.561 |
| -1.69000000000007 | 1.402 | 0.608 | -0.572 |
| -1.685000000000071 | 1.396 | 0.6 | -0.582 |
| -1.680000000000071 | 1.39 | 0.592 | -0.592 |
| -1.675000000000071 | 1.385 | 0.584 | -0.602 |
| -1.670000000000071 | 1.379 | 0.577 | -0.613 |
| -1.665000000000071 | 1.373 | 0.569 | -0.623 |
| -1.660000000000071 | 1.367 | 0.561 | -0.633 |
| -1.655000000000071 | 1.361 | 0.553 | -0.644 |
| -1.650000000000071 | 1.355 | 0.545 | -0.654 |
| -1.645000000000071 | 1.35 | 0.537 | -0.664 |
| -1.640000000000072 | 1.344 | 0.53 | -0.675 |
| -1.635000000000072 | 1.338 | 0.522 | -0.685 |
| -1.630000000000072 | 1.332 | 0.514 | -0.696 |
| -1.625000000000072 | 1.326 | 0.506 | -0.706 |
| -1.620000000000072 | 1.32 | 0.498 | -0.717 |
| -1.615000000000072 | 1.314 | 0.49 | -0.727 |
| -1.610000000000072 | 1.308 | 0.482 | -0.738 |
| -1.605000000000072 | 1.303 | 0.474 | -0.748 |
| -1.600000000000072 | 1.297 | 0.466 | -0.759 |
| -1.595000000000073 | 1.291 | 0.458 | -0.77 |
| -1.590000000000073 | 1.285 | 0.45 | -0.78 |
| -1.585000000000073 | 1.279 | 0.442 | -0.791 |
| -1.580000000000073 | 1.273 | 0.434 | -0.802 |
| -1.575000000000073 | 1.267 | 0.426 | -0.812 |
| -1.570000000000073 | 1.261 | 0.418 | -0.823 |
| -1.565000000000073 | 1.255 | 0.41 | -0.834 |
| -1.560000000000073 | 1.249 | 0.402 | -0.845 |
| -1.555000000000073 | 1.243 | 0.393 | -0.856 |
| -1.550000000000074 | 1.237 | 0.385 | -0.866 |
| -1.545000000000074 | 1.231 | 0.377 | -0.877 |
| -1.540000000000074 | 1.226 | 0.369 | -0.888 |
| -1.535000000000074 | 1.22 | 0.361 | -0.899 |
| -1.530000000000074 | 1.214 | 0.352 | -0.91 |
| -1.525000000000074 | 1.208 | 0.344 | -0.921 |
| -1.520000000000074 | 1.202 | 0.336 | -0.932 |
| -1.515000000000074 | 1.196 | 0.328 | -0.943 |
| -1.510000000000074 | 1.19 | 0.319 | -0.955 |
| -1.505000000000074 | 1.184 | 0.311 | -0.966 |
| -1.500000000000075 | 1.178 | 0.303 | -0.977 |
| -1.495000000000075 | 1.172 | 0.294 | -0.988 |
| -1.490000000000075 | 1.166 | 0.286 | -0.999 |
| -1.485000000000075 | 1.16 | 0.278 | -1.01 |
| -1.480000000000075 | 1.154 | 0.269 | -1.022 |
| -1.475000000000075 | 1.148 | 0.261 | -1.033 |
| -1.470000000000075 | 1.141 | 0.252 | -1.044 |
| -1.465000000000075 | 1.135 | 0.244 | -1.056 |
| -1.460000000000075 | 1.129 | 0.236 | -1.067 |
| -1.455000000000076 | 1.123 | 0.227 | -1.079 |
| -1.450000000000076 | 1.117 | 0.219 | -1.09 |
| -1.445000000000076 | 1.111 | 0.21 | -1.102 |
| -1.440000000000076 | 1.105 | 0.201 | -1.113 |
| -1.435000000000076 | 1.099 | 0.193 | -1.125 |
| -1.430000000000076 | 1.093 | 0.184 | -1.136 |
| -1.425000000000076 | 1.087 | 0.176 | -1.148 |
| -1.420000000000076 | 1.081 | 0.167 | -1.16 |
| -1.415000000000076 | 1.075 | 0.158 | -1.171 |
| -1.410000000000077 | 1.068 | 0.15 | -1.183 |
| -1.405000000000077 | 1.062 | 0.141 | -1.195 |
| -1.400000000000077 | 1.056 | 0.132 | -1.207 |
| -1.395000000000077 | 1.05 | 0.124 | -1.219 |
| -1.390000000000077 | 1.044 | 0.115 | -1.23 |
| -1.385000000000077 | 1.038 | 0.106 | -1.242 |
| -1.380000000000077 | 1.031 | 0.097 | -1.254 |
| -1.375000000000077 | 1.025 | 0.088 | -1.266 |
| -1.370000000000077 | 1.019 | 0.08 | -1.278 |
| -1.365000000000077 | 1.013 | 0.071 | -1.29 |
| -1.360000000000078 | 1.007 | 0.062 | -1.302 |
| -1.355000000000078 | 1.001 | 0.053 | -1.315 |
| -1.350000000000078 | 0.994 | 0.044 | -1.327 |
| -1.345000000000078 | 0.988 | 0.035 | -1.339 |
| -1.340000000000078 | 0.982 | 0.026 | -1.351 |
| -1.335000000000078 | 0.976 | 0.017 | -1.363 |
| -1.330000000000078 | 0.969 | 0.008 | -1.376 |
| -1.325000000000078 | 0.963 | -0.001 | -1.388 |
| -1.320000000000078 | 0.957 | -0.01 | -1.4 |
| -1.315000000000079 | 0.951 | -0.019 | -1.413 |
| -1.310000000000079 | 0.944 | -0.028 | -1.425 |
| -1.305000000000079 | 0.938 | -0.037 | -1.438 |
| -1.300000000000079 | 0.932 | -0.046 | -1.45 |
| -1.295000000000079 | 0.925 | -0.056 | -1.463 |
| -1.29000000000008 | 0.919 | -0.065 | -1.476 |
| -1.285000000000079 | 0.913 | -0.074 | -1.488 |
| -1.280000000000079 | 0.906 | -0.083 | -1.501 |
| -1.275000000000079 | 0.9 | -0.093 | -1.514 |
| -1.270000000000079 | 0.894 | -0.102 | -1.527 |
| -1.26500000000008 | 0.887 | -0.111 | -1.54 |
| -1.26000000000008 | 0.881 | -0.121 | -1.552 |
| -1.25500000000008 | 0.875 | -0.13 | -1.565 |
| -1.25000000000008 | 0.868 | -0.139 | -1.578 |
| -1.24500000000008 | 0.862 | -0.149 | -1.591 |
| -1.24000000000008 | 0.855 | -0.158 | -1.604 |
| -1.23500000000008 | 0.849 | -0.168 | -1.618 |
| -1.23000000000008 | 0.842 | -0.177 | -1.631 |
| -1.22500000000008 | 0.836 | -0.187 | -1.644 |
| -1.220000000000081 | 0.83 | -0.197 | -1.657 |
| -1.215000000000081 | 0.823 | -0.206 | -1.67 |
| -1.210000000000081 | 0.817 | -0.216 | -1.684 |
| -1.205000000000081 | 0.81 | -0.226 | -1.697 |
| -1.200000000000081 | 0.804 | -0.235 | -1.711 |
| -1.195000000000081 | 0.797 | -0.245 | -1.724 |
| -1.190000000000081 | 0.791 | -0.255 | -1.738 |
| -1.185000000000081 | 0.784 | -0.265 | -1.751 |
| -1.180000000000081 | 0.777 | -0.274 | -1.765 |
| -1.175000000000082 | 0.771 | -0.284 | -1.779 |
| -1.170000000000082 | 0.764 | -0.294 | -1.792 |
| -1.165000000000082 | 0.758 | -0.304 | -1.806 |
| -1.160000000000082 | 0.751 | -0.314 | -1.82 |
| -1.155000000000082 | 0.745 | -0.324 | -1.834 |
| -1.150000000000082 | 0.738 | -0.334 | -1.848 |
| -1.145000000000082 | 0.731 | -0.344 | -1.862 |
| -1.140000000000082 | 0.725 | -0.354 | -1.876 |
| -1.135000000000082 | 0.718 | -0.364 | -1.89 |
| -1.130000000000082 | 0.711 | -0.374 | -1.904 |
| -1.125000000000083 | 0.705 | -0.385 | -1.918 |
| -1.120000000000083 | 0.698 | -0.395 | -1.933 |
| -1.115000000000083 | 0.691 | -0.405 | -1.947 |
| -1.110000000000083 | 0.684 | -0.415 | -1.961 |
| -1.105000000000083 | 0.678 | -0.426 | -1.976 |
| -1.100000000000083 | 0.671 | -0.436 | -1.99 |
| -1.095000000000083 | 0.664 | -0.446 | -2.005 |
| -1.090000000000083 | 0.657 | -0.457 | -2.019 |
| -1.085000000000083 | 0.651 | -0.467 | -2.034 |
| -1.080000000000084 | 0.644 | -0.478 | -2.049 |
| -1.075000000000084 | 0.637 | -0.488 | -2.063 |
| -1.070000000000084 | 0.63 | -0.499 | -2.078 |
| -1.065000000000084 | 0.623 | -0.509 | -2.093 |
| -1.060000000000084 | 0.616 | -0.52 | -2.108 |
| -1.055000000000084 | 0.61 | -0.531 | -2.123 |
| -1.050000000000084 | 0.603 | -0.542 | -2.138 |
| -1.045000000000084 | 0.596 | -0.552 | -2.154 |
| -1.040000000000084 | 0.589 | -0.563 | -2.169 |
| -1.035000000000085 | 0.582 | -0.574 | -2.184 |
| -1.030000000000085 | 0.575 | -0.585 | -2.199 |
| -1.025000000000085 | 0.568 | -0.596 | -2.215 |
| -1.020000000000085 | 0.561 | -0.607 | -2.23 |
| -1.015000000000085 | 0.554 | -0.618 | -2.246 |
| -1.010000000000085 | 0.547 | -0.629 | -2.262 |
| -1.005000000000085 | 0.54 | -0.64 | -2.277 |
| -1.000000000000085 | 0.533 | -0.651 | -2.293 |
| -0.995000000000085 | 0.526 | -0.662 | -2.309 |
| -0.990000000000085 | 0.519 | -0.674 | -2.325 |
| -0.985000000000085 | 0.512 | -0.685 | -2.341 |
| -0.980000000000085 | 0.504 | -0.696 | -2.357 |
| -0.975000000000085 | 0.497 | -0.708 | -2.373 |
| -0.970000000000085 | 0.49 | -0.719 | -2.389 |
| -0.965000000000085 | 0.483 | -0.731 | -2.406 |
| -0.960000000000085 | 0.476 | -0.742 | -2.422 |
| -0.955000000000085 | 0.468 | -0.754 | -2.438 |
| -0.950000000000085 | 0.461 | -0.765 | -2.455 |
| -0.945000000000085 | 0.454 | -0.777 | -2.471 |
| -0.940000000000085 | 0.447 | -0.789 | -2.488 |
| -0.935000000000085 | 0.439 | -0.801 | -2.505 |
| -0.930000000000085 | 0.432 | -0.812 | -2.522 |
| -0.925000000000085 | 0.425 | -0.824 | -2.539 |
| -0.920000000000085 | 0.417 | -0.836 | -2.556 |
| -0.915000000000085 | 0.41 | -0.848 | -2.573 |
| -0.910000000000085 | 0.402 | -0.86 | -2.59 |
| -0.905000000000085 | 0.395 | -0.872 | -2.607 |
| -0.900000000000085 | 0.388 | -0.884 | -2.625 |
| -0.895000000000085 | 0.38 | -0.897 | -2.642 |
| -0.890000000000085 | 0.373 | -0.909 | -2.66 |
| -0.885000000000085 | 0.365 | -0.921 | -2.677 |
| -0.880000000000085 | 0.357 | -0.934 | -2.695 |
| -0.875000000000085 | 0.35 | -0.946 | -2.713 |
| -0.870000000000085 | 0.342 | -0.959 | -2.731 |
| -0.865000000000085 | 0.335 | -0.971 | -2.749 |
| -0.860000000000085 | 0.327 | -0.984 | -2.767 |
| -0.855000000000085 | 0.319 | -0.996 | -2.785 |
| -0.850000000000085 | 0.312 | -1.009 | -2.803 |
| -0.845000000000085 | 0.304 | -1.022 | -2.822 |
| -0.840000000000085 | 0.296 | -1.035 | -2.84 |
| -0.835000000000085 | 0.288 | -1.048 | -2.859 |
| -0.830000000000085 | 0.281 | -1.061 | -2.877 |
| -0.825000000000085 | 0.273 | -1.074 | -2.896 |
| -0.820000000000085 | 0.265 | -1.087 | -2.915 |
| -0.815000000000085 | 0.257 | -1.1 | -2.934 |
| -0.810000000000085 | 0.249 | -1.114 | -2.953 |
| -0.805000000000085 | 0.241 | -1.127 | -2.972 |
| -0.800000000000085 | 0.233 | -1.14 | -2.992 |
| -0.795000000000085 | 0.225 | -1.154 | -3.011 |
| -0.790000000000085 | 0.217 | -1.167 | -3.031 |
| -0.785000000000085 | 0.209 | -1.181 | -3.051 |
| -0.780000000000085 | 0.201 | -1.195 | -3.07 |
| -0.775000000000085 | 0.193 | -1.209 | -3.09 |
| -0.770000000000085 | 0.184 | -1.223 | -3.11 |
| -0.765000000000085 | 0.176 | -1.236 | -3.131 |
| -0.760000000000085 | 0.168 | -1.251 | -3.151 |
| -0.755000000000085 | 0.16 | -1.265 | -3.171 |
| -0.750000000000085 | 0.151 | -1.279 | -3.192 |
| -0.745000000000085 | 0.143 | -1.293 | -3.212 |
| -0.740000000000085 | 0.135 | -1.307 | -3.233 |
| -0.735000000000085 | 0.126 | -1.322 | -3.254 |
| -0.730000000000085 | 0.118 | -1.336 | -3.275 |
| -0.725000000000085 | 0.109 | -1.351 | -3.297 |
| -0.720000000000085 | 0.101 | -1.366 | -3.318 |
| -0.715000000000085 | 0.092 | -1.381 | -3.339 |
| -0.710000000000085 | 0.084 | -1.396 | -3.361 |
| -0.705000000000085 | 0.075 | -1.411 | -3.383 |
| -0.700000000000085 | 0.066 | -1.426 | -3.405 |
| -0.695000000000085 | 0.057 | -1.441 | -3.427 |
| -0.690000000000085 | 0.049 | -1.456 | -3.449 |
| -0.685000000000085 | 0.04 | -1.471 | -3.471 |
| -0.680000000000085 | 0.031 | -1.487 | -3.494 |
| -0.675000000000085 | 0.022 | -1.503 | -3.517 |
| -0.670000000000085 | 0.013 | -1.518 | -3.54 |
| -0.665000000000085 | 0.004 | -1.534 | -3.563 |
| -0.660000000000085 | -0.005 | -1.55 | -3.586 |
| -0.655000000000085 | -0.014 | -1.566 | -3.609 |
| -0.650000000000085 | -0.023 | -1.582 | -3.633 |
| -0.645000000000085 | -0.032 | -1.598 | -3.656 |
| -0.640000000000085 | -0.042 | -1.615 | -3.68 |
| -0.635000000000085 | -0.051 | -1.631 | -3.704 |
| -0.630000000000085 | -0.06 | -1.648 | -3.728 |
| -0.625000000000085 | -0.07 | -1.664 | -3.753 |
| -0.620000000000085 | -0.079 | -1.681 | -3.778 |
| -0.615000000000085 | -0.089 | -1.698 | -3.802 |
| -0.610000000000085 | -0.098 | -1.715 | -3.827 |
| -0.605000000000085 | -0.108 | -1.732 | -3.853 |
| -0.600000000000085 | -0.118 | -1.75 | -3.878 |
| -0.595000000000085 | -0.127 | -1.767 | -3.904 |
| -0.590000000000085 | -0.137 | -1.785 | -3.929 |
| -0.585000000000085 | -0.147 | -1.803 | -3.955 |
| -0.580000000000085 | -0.157 | -1.82 | -3.982 |
| -0.575000000000085 | -0.167 | -1.838 | -4.008 |
| -0.570000000000085 | -0.177 | -1.857 | -4.035 |
| -0.565000000000085 | -0.187 | -1.875 | -4.062 |
| -0.560000000000085 | -0.197 | -1.893 | -4.089 |
| -0.555000000000085 | -0.208 | -1.912 | -4.116 |
| -0.550000000000085 | -0.218 | -1.931 | -4.144 |
| -0.545000000000085 | -0.228 | -1.95 | -4.172 |
| -0.540000000000085 | -0.239 | -1.969 | -4.2 |
| -0.535000000000085 | -0.249 | -1.988 | -4.228 |
| -0.530000000000085 | -0.26 | -2.008 | -4.257 |
| -0.525000000000085 | -0.271 | -2.027 | -4.285 |
| -0.520000000000085 | -0.282 | -2.047 | -4.315 |
| -0.515000000000085 | -0.292 | -2.067 | -4.344 |
| -0.510000000000085 | -0.303 | -2.087 | -4.374 |
| -0.505000000000085 | -0.314 | -2.107 | -4.404 |
| -0.500000000000085 | -0.326 | -2.128 | -4.434 |
| -0.495000000000085 | -0.337 | -2.149 | -4.465 |
| -0.490000000000085 | -0.348 | -2.169 | -4.495 |
| -0.485000000000085 | -0.36 | -2.191 | -4.527 |
| -0.480000000000085 | -0.371 | -2.212 | -4.558 |
| -0.475000000000085 | -0.383 | -2.233 | -4.59 |
| -0.470000000000085 | -0.394 | -2.255 | -4.622 |
| -0.465000000000085 | -0.406 | -2.277 | -4.654 |
| -0.460000000000085 | -0.418 | -2.299 | -4.687 |
| -0.455000000000085 | -0.43 | -2.322 | -4.72 |
| -0.450000000000085 | -0.442 | -2.344 | -4.754 |
| -0.445000000000085 | -0.454 | -2.367 | -4.788 |
| -0.440000000000085 | -0.467 | -2.39 | -4.822 |
| -0.435000000000085 | -0.479 | -2.414 | -4.857 |
| -0.430000000000085 | -0.492 | -2.438 | -4.892 |
| -0.425000000000085 | -0.505 | -2.461 | -4.927 |
| -0.420000000000085 | -0.517 | -2.486 | -4.963 |
| -0.415000000000085 | -0.53 | -2.51 | -4.999 |
| -0.410000000000085 | -0.544 | -2.535 | -5.036 |
| -0.405000000000085 | -0.557 | -2.56 | -5.073 |
| -0.400000000000085 | -0.57 | -2.585 | -5.111 |
| -0.395000000000085 | -0.584 | -2.611 | -5.149 |
| -0.390000000000085 | -0.597 | -2.637 | -5.187 |
| -0.385000000000085 | -0.611 | -2.663 | -5.226 |
| -0.380000000000085 | -0.625 | -2.69 | -5.266 |
| -0.375000000000085 | -0.639 | -2.717 | -5.306 |
| -0.370000000000085 | -0.654 | -2.744 | -5.347 |
| -0.365000000000085 | -0.668 | -2.772 | -5.388 |
| -0.360000000000085 | -0.683 | -2.8 | -5.429 |
| -0.355000000000085 | -0.698 | -2.828 | -5.472 |
| -0.350000000000085 | -0.713 | -2.857 | -5.515 |
| -0.345000000000085 | -0.728 | -2.886 | -5.558 |
| -0.340000000000085 | -0.743 | -2.916 | -5.602 |
| -0.335000000000085 | -0.759 | -2.946 | -5.647 |
| -0.330000000000085 | -0.775 | -2.976 | -5.692 |
| -0.325000000000085 | -0.791 | -3.007 | -5.738 |
| -0.320000000000085 | -0.807 | -3.039 | -5.785 |
| -0.315000000000085 | -0.824 | -3.071 | -5.833 |
| -0.310000000000085 | -0.841 | -3.103 | -5.881 |
| -0.305000000000085 | -0.858 | -3.136 | -5.93 |
| -0.300000000000085 | -0.875 | -3.169 | -5.98 |
| -0.295000000000085 | -0.892 | -3.203 | -6.03 |
| -0.290000000000085 | -0.91 | -3.238 | -6.082 |
| -0.285000000000085 | -0.928 | -3.273 | -6.134 |
| -0.280000000000085 | -0.947 | -3.309 | -6.188 |
| -0.275000000000085 | -0.965 | -3.345 | -6.242 |
| -0.270000000000085 | -0.984 | -3.382 | -6.297 |
| -0.265000000000085 | -1.004 | -3.42 | -6.354 |
| -0.260000000000085 | -1.023 | -3.458 | -6.411 |
| -0.255000000000085 | -1.044 | -3.497 | -6.469 |
| -0.250000000000085 | -1.064 | -3.537 | -6.529 |
| -0.245000000000085 | -1.085 | -3.578 | -6.59 |
| -0.240000000000085 | -1.106 | -3.62 | -6.652 |
| -0.235000000000085 | -1.128 | -3.662 | -6.715 |
| -0.230000000000085 | -1.15 | -3.705 | -6.78 |
| -0.225000000000085 | -1.172 | -3.75 | -6.846 |
| -0.220000000000085 | -1.195 | -3.795 | -6.914 |
| -0.215000000000085 | -1.219 | -3.841 | -6.983 |
| -0.210000000000085 | -1.243 | -3.888 | -7.054 |
| -0.205000000000085 | -1.267 | -3.937 | -7.126 |
| -0.200000000000085 | -1.293 | -3.986 | -7.2 |
| -0.195000000000085 | -1.318 | -4.037 | -7.276 |
| -0.190000000000085 | -1.345 | -4.09 | -7.354 |
| -0.185000000000085 | -1.372 | -4.143 | -7.435 |
| -0.180000000000085 | -1.4 | -4.198 | -7.517 |
| -0.175000000000085 | -1.428 | -4.255 | -7.602 |
| -0.170000000000085 | -1.458 | -4.313 | -7.689 |
| -0.165000000000085 | -1.488 | -4.373 | -7.778 |
| -0.160000000000085 | -1.519 | -4.435 | -7.871 |
| -0.155000000000084 | -1.551 | -4.498 | -7.966 |
| -0.150000000000084 | -1.585 | -4.564 | -8.065 |
| -0.145000000000084 | -1.619 | -4.632 | -8.167 |
| -0.140000000000084 | -1.654 | -4.702 | -8.272 |
| -0.135000000000084 | -1.691 | -4.775 | -8.381 |
| -0.130000000000084 | -1.729 | -4.851 | -8.495 |
| -0.125000000000084 | -1.769 | -4.93 | -8.612 |
| -0.120000000000084 | -1.81 | -5.011 | -8.735 |
| -0.115000000000084 | -1.853 | -5.097 | -8.863 |
| -0.110000000000084 | -1.897 | -5.186 | -8.996 |
| -0.105000000000084 | -1.944 | -5.279 | -9.136 |
| -0.100000000000084 | -1.993 | -5.377 | -9.282 |
| -0.0950000000000844 | -2.045 | -5.479 | -9.436 |
| -0.0900000000000844 | -2.099 | -5.587 | -9.598 |
| -0.0850000000000844 | -2.156 | -5.702 | -9.77 |
| -0.0800000000000844 | -2.217 | -5.823 | -9.952 |
| -0.0750000000000844 | -2.282 | -5.952 | -10.146 |
| -0.0700000000000844 | -2.351 | -6.09 | -10.353 |
| -0.0650000000000844 | -2.425 | -6.239 | -10.575 |
| -0.0600000000000844 | -2.506 | -6.399 | -10.815 |
| -0.0550000000000844 | -2.593 | -6.573 | -11.076 |
| -0.0500000000000844 | -2.688 | -6.764 | -11.362 |
| -0.0450000000000844 | -2.794 | -6.975 | -11.678 |
| -0.0400000000000844 | -2.912 | -7.21 | -12.032 |
| -0.0350000000000844 | -3.045 | -7.477 | -12.432 |
| -0.0300000000000844 | -3.199 | -7.786 | -12.895 |
| -0.0250000000000844 | -3.382 | -8.15 | -13.442 |
| -0.0200000000000844 | -3.605 | -8.597 | -14.111 |
| -0.0150000000000844 | -3.893 | -9.172 | -14.974 |
| -0.0100000000000844 | -4.298 | -9.983 | -16.191 |
| -0.00500000000008444 | -4.991 | -11.369 | -18.27 |
| -8.4444604087075e-14 | -29.796 | -60.978 | -92.683 |
| 0.00499999999991555 | -4.991 | -11.369 | -18.27 |
| 0.00999999999991555 | -4.298 | -9.983 | -16.191 |
| 0.0149999999999156 | -3.893 | -9.172 | -14.974 |
| 0.0199999999999156 | -3.605 | -8.597 | -14.111 |
| 0.0249999999999156 | -3.382 | -8.15 | -13.442 |
| 0.0299999999999156 | -3.199 | -7.786 | -12.895 |
| 0.0349999999999155 | -3.045 | -7.477 | -12.432 |
| 0.0399999999999155 | -2.912 | -7.21 | -12.032 |
| 0.0449999999999155 | -2.794 | -6.975 | -11.678 |
| 0.0499999999999155 | -2.688 | -6.764 | -11.362 |
| 0.0549999999999155 | -2.593 | -6.573 | -11.076 |
| 0.0599999999999155 | -2.506 | -6.399 | -10.815 |
| 0.0649999999999155 | -2.425 | -6.239 | -10.575 |
| 0.0699999999999155 | -2.351 | -6.09 | -10.353 |
| 0.0749999999999155 | -2.282 | -5.952 | -10.146 |
| 0.0799999999999155 | -2.217 | -5.823 | -9.952 |
| 0.0849999999999155 | -2.156 | -5.702 | -9.77 |
| 0.0899999999999155 | -2.099 | -5.587 | -9.598 |
| 0.0949999999999155 | -2.045 | -5.479 | -9.436 |
| 0.0999999999999155 | -1.993 | -5.377 | -9.282 |
| 0.104999999999916 | -1.944 | -5.279 | -9.136 |
| 0.109999999999916 | -1.897 | -5.186 | -8.996 |
| 0.114999999999916 | -1.853 | -5.097 | -8.863 |
| 0.119999999999916 | -1.81 | -5.011 | -8.735 |
| 0.124999999999916 | -1.769 | -4.93 | -8.612 |
| 0.129999999999916 | -1.729 | -4.851 | -8.495 |
| 0.134999999999916 | -1.691 | -4.775 | -8.381 |
| 0.139999999999916 | -1.654 | -4.702 | -8.272 |
| 0.144999999999916 | -1.619 | -4.632 | -8.167 |
| 0.149999999999916 | -1.585 | -4.564 | -8.065 |
| 0.154999999999916 | -1.551 | -4.498 | -7.966 |
| 0.159999999999916 | -1.519 | -4.435 | -7.871 |
| 0.164999999999916 | -1.488 | -4.373 | -7.778 |
| 0.169999999999916 | -1.458 | -4.313 | -7.689 |
| 0.174999999999916 | -1.428 | -4.255 | -7.602 |
| 0.179999999999916 | -1.4 | -4.198 | -7.517 |
| 0.184999999999916 | -1.372 | -4.143 | -7.435 |
| 0.189999999999916 | -1.345 | -4.09 | -7.354 |
| 0.194999999999916 | -1.318 | -4.037 | -7.276 |
| 0.199999999999916 | -1.293 | -3.986 | -7.2 |
| 0.204999999999916 | -1.267 | -3.937 | -7.126 |
| 0.209999999999916 | -1.243 | -3.888 | -7.054 |
| 0.214999999999916 | -1.219 | -3.841 | -6.983 |
| 0.219999999999916 | -1.195 | -3.795 | -6.914 |
| 0.224999999999916 | -1.172 | -3.75 | -6.846 |
| 0.229999999999916 | -1.15 | -3.705 | -6.78 |
| 0.234999999999916 | -1.128 | -3.662 | -6.715 |
| 0.239999999999916 | -1.106 | -3.62 | -6.652 |
| 0.244999999999916 | -1.085 | -3.578 | -6.59 |
| 0.249999999999916 | -1.064 | -3.537 | -6.529 |
| 0.254999999999916 | -1.044 | -3.497 | -6.469 |
| 0.259999999999916 | -1.023 | -3.458 | -6.411 |
| 0.264999999999916 | -1.004 | -3.42 | -6.354 |
| 0.269999999999916 | -0.984 | -3.382 | -6.297 |
| 0.274999999999916 | -0.965 | -3.345 | -6.242 |
| 0.279999999999916 | -0.947 | -3.309 | -6.188 |
| 0.284999999999916 | -0.928 | -3.273 | -6.134 |
| 0.289999999999916 | -0.91 | -3.238 | -6.082 |
| 0.294999999999916 | -0.892 | -3.203 | -6.03 |
| 0.299999999999916 | -0.875 | -3.169 | -5.98 |
| 0.304999999999916 | -0.858 | -3.136 | -5.93 |
| 0.309999999999916 | -0.841 | -3.103 | -5.881 |
| 0.314999999999916 | -0.824 | -3.071 | -5.833 |
| 0.319999999999916 | -0.807 | -3.039 | -5.785 |
| 0.324999999999916 | -0.791 | -3.007 | -5.738 |
| 0.329999999999916 | -0.775 | -2.976 | -5.692 |
| 0.334999999999916 | -0.759 | -2.946 | -5.647 |
| 0.339999999999916 | -0.743 | -2.916 | -5.602 |
| 0.344999999999916 | -0.728 | -2.886 | -5.558 |
| 0.349999999999916 | -0.713 | -2.857 | -5.515 |
| 0.354999999999916 | -0.698 | -2.828 | -5.472 |
| 0.359999999999916 | -0.683 | -2.8 | -5.429 |
| 0.364999999999916 | -0.668 | -2.772 | -5.388 |
| 0.369999999999916 | -0.654 | -2.744 | -5.347 |
| 0.374999999999916 | -0.639 | -2.717 | -5.306 |
| 0.379999999999916 | -0.625 | -2.69 | -5.266 |
| 0.384999999999916 | -0.611 | -2.663 | -5.226 |
| 0.389999999999916 | -0.597 | -2.637 | -5.187 |
| 0.394999999999916 | -0.584 | -2.611 | -5.149 |
| 0.399999999999916 | -0.57 | -2.585 | -5.111 |
| 0.404999999999916 | -0.557 | -2.56 | -5.073 |
| 0.409999999999916 | -0.544 | -2.535 | -5.036 |
| 0.414999999999916 | -0.53 | -2.51 | -4.999 |
| 0.419999999999916 | -0.517 | -2.486 | -4.963 |
| 0.424999999999916 | -0.505 | -2.461 | -4.927 |
| 0.429999999999916 | -0.492 | -2.438 | -4.892 |
| 0.434999999999916 | -0.479 | -2.414 | -4.857 |
| 0.439999999999916 | -0.467 | -2.39 | -4.822 |
| 0.444999999999916 | -0.454 | -2.367 | -4.788 |
| 0.449999999999916 | -0.442 | -2.344 | -4.754 |
| 0.454999999999916 | -0.43 | -2.322 | -4.72 |
| 0.459999999999916 | -0.418 | -2.299 | -4.687 |
| 0.464999999999916 | -0.406 | -2.277 | -4.654 |
| 0.469999999999916 | -0.394 | -2.255 | -4.622 |
| 0.474999999999916 | -0.383 | -2.233 | -4.59 |
| 0.479999999999916 | -0.371 | -2.212 | -4.558 |
| 0.484999999999916 | -0.36 | -2.191 | -4.527 |
| 0.489999999999916 | -0.348 | -2.169 | -4.495 |
| 0.494999999999916 | -0.337 | -2.149 | -4.465 |
| 0.499999999999916 | -0.326 | -2.128 | -4.434 |
| 0.504999999999916 | -0.314 | -2.107 | -4.404 |
| 0.509999999999916 | -0.303 | -2.087 | -4.374 |
| 0.514999999999916 | -0.292 | -2.067 | -4.344 |
| 0.519999999999916 | -0.282 | -2.047 | -4.315 |
| 0.524999999999916 | -0.271 | -2.027 | -4.285 |
| 0.529999999999916 | -0.26 | -2.008 | -4.257 |
| 0.534999999999916 | -0.249 | -1.988 | -4.228 |
| 0.539999999999916 | -0.239 | -1.969 | -4.2 |
| 0.544999999999916 | -0.228 | -1.95 | -4.172 |
| 0.549999999999916 | -0.218 | -1.931 | -4.144 |
| 0.554999999999916 | -0.208 | -1.912 | -4.116 |
| 0.559999999999916 | -0.197 | -1.893 | -4.089 |
| 0.564999999999916 | -0.187 | -1.875 | -4.062 |
| 0.569999999999916 | -0.177 | -1.857 | -4.035 |
| 0.574999999999916 | -0.167 | -1.838 | -4.008 |
| 0.579999999999916 | -0.157 | -1.82 | -3.982 |
| 0.584999999999916 | -0.147 | -1.803 | -3.955 |
| 0.589999999999916 | -0.137 | -1.785 | -3.929 |
| 0.594999999999916 | -0.127 | -1.767 | -3.904 |
| 0.599999999999916 | -0.118 | -1.75 | -3.878 |
| 0.604999999999916 | -0.108 | -1.732 | -3.853 |
| 0.609999999999916 | -0.098 | -1.715 | -3.827 |
| 0.614999999999916 | -0.089 | -1.698 | -3.802 |
| 0.619999999999916 | -0.079 | -1.681 | -3.778 |
| 0.624999999999916 | -0.07 | -1.664 | -3.753 |
| 0.629999999999916 | -0.06 | -1.648 | -3.728 |
| 0.634999999999916 | -0.051 | -1.631 | -3.704 |
| 0.639999999999916 | -0.042 | -1.615 | -3.68 |
| 0.644999999999916 | -0.032 | -1.598 | -3.656 |
| 0.649999999999916 | -0.023 | -1.582 | -3.633 |
| 0.654999999999916 | -0.014 | -1.566 | -3.609 |
| 0.659999999999916 | -0.005 | -1.55 | -3.586 |
| 0.664999999999916 | 0.004 | -1.534 | -3.563 |
| 0.669999999999916 | 0.013 | -1.518 | -3.54 |
| 0.674999999999916 | 0.022 | -1.503 | -3.517 |
| 0.679999999999916 | 0.031 | -1.487 | -3.494 |
| 0.684999999999916 | 0.04 | -1.471 | -3.471 |
| 0.689999999999916 | 0.049 | -1.456 | -3.449 |
| 0.694999999999916 | 0.057 | -1.441 | -3.427 |
| 0.699999999999916 | 0.066 | -1.426 | -3.405 |
| 0.704999999999916 | 0.075 | -1.411 | -3.383 |
| 0.709999999999916 | 0.084 | -1.396 | -3.361 |
| 0.714999999999916 | 0.092 | -1.381 | -3.339 |
| 0.719999999999916 | 0.101 | -1.366 | -3.318 |
| 0.724999999999916 | 0.109 | -1.351 | -3.297 |
| 0.729999999999916 | 0.118 | -1.336 | -3.275 |
| 0.734999999999916 | 0.126 | -1.322 | -3.254 |
| 0.739999999999916 | 0.135 | -1.307 | -3.233 |
| 0.744999999999916 | 0.143 | -1.293 | -3.212 |
| 0.749999999999916 | 0.151 | -1.279 | -3.192 |
| 0.754999999999916 | 0.16 | -1.265 | -3.171 |
| 0.759999999999916 | 0.168 | -1.251 | -3.151 |
| 0.764999999999916 | 0.176 | -1.236 | -3.131 |
| 0.769999999999916 | 0.184 | -1.223 | -3.11 |
| 0.774999999999916 | 0.193 | -1.209 | -3.09 |
| 0.779999999999916 | 0.201 | -1.195 | -3.07 |
| 0.784999999999916 | 0.209 | -1.181 | -3.051 |
| 0.789999999999916 | 0.217 | -1.167 | -3.031 |
| 0.794999999999916 | 0.225 | -1.154 | -3.011 |
| 0.799999999999916 | 0.233 | -1.14 | -2.992 |
| 0.804999999999916 | 0.241 | -1.127 | -2.972 |
| 0.809999999999916 | 0.249 | -1.114 | -2.953 |
| 0.814999999999916 | 0.257 | -1.1 | -2.934 |
| 0.819999999999916 | 0.265 | -1.087 | -2.915 |
| 0.824999999999916 | 0.273 | -1.074 | -2.896 |
| 0.829999999999916 | 0.281 | -1.061 | -2.877 |
| 0.834999999999916 | 0.288 | -1.048 | -2.859 |
| 0.839999999999916 | 0.296 | -1.035 | -2.84 |
| 0.844999999999916 | 0.304 | -1.022 | -2.822 |
| 0.849999999999916 | 0.312 | -1.009 | -2.803 |
| 0.854999999999916 | 0.319 | -0.996 | -2.785 |
| 0.859999999999916 | 0.327 | -0.984 | -2.767 |
| 0.864999999999916 | 0.335 | -0.971 | -2.749 |
| 0.869999999999916 | 0.342 | -0.959 | -2.731 |
| 0.874999999999916 | 0.35 | -0.946 | -2.713 |
| 0.879999999999916 | 0.357 | -0.934 | -2.695 |
| 0.884999999999916 | 0.365 | -0.921 | -2.677 |
| 0.889999999999916 | 0.373 | -0.909 | -2.66 |
| 0.894999999999916 | 0.38 | -0.897 | -2.642 |
| 0.899999999999916 | 0.388 | -0.884 | -2.625 |
| 0.904999999999916 | 0.395 | -0.872 | -2.607 |
| 0.909999999999916 | 0.402 | -0.86 | -2.59 |
| 0.914999999999916 | 0.41 | -0.848 | -2.573 |
| 0.919999999999916 | 0.417 | -0.836 | -2.556 |
| 0.924999999999916 | 0.425 | -0.824 | -2.539 |
| 0.929999999999916 | 0.432 | -0.812 | -2.522 |
| 0.934999999999916 | 0.439 | -0.801 | -2.505 |
| 0.939999999999916 | 0.447 | -0.789 | -2.488 |
| 0.944999999999916 | 0.454 | -0.777 | -2.471 |
| 0.949999999999916 | 0.461 | -0.765 | -2.455 |
| 0.954999999999916 | 0.468 | -0.754 | -2.438 |
| 0.959999999999916 | 0.476 | -0.742 | -2.422 |
| 0.964999999999916 | 0.483 | -0.731 | -2.406 |
| 0.969999999999916 | 0.49 | -0.719 | -2.389 |
| 0.974999999999916 | 0.497 | -0.708 | -2.373 |
| 0.979999999999916 | 0.504 | -0.696 | -2.357 |
| 0.984999999999916 | 0.512 | -0.685 | -2.341 |
| 0.989999999999916 | 0.519 | -0.674 | -2.325 |
| 0.994999999999916 | 0.526 | -0.662 | -2.309 |
| 0.999999999999916 | 0.533 | -0.651 | -2.293 |
| 1.004999999999916 | 0.54 | -0.64 | -2.277 |
| 1.009999999999916 | 0.547 | -0.629 | -2.262 |
| 1.014999999999916 | 0.554 | -0.618 | -2.246 |
| 1.019999999999916 | 0.561 | -0.607 | -2.23 |
| 1.024999999999916 | 0.568 | -0.596 | -2.215 |
| 1.029999999999916 | 0.575 | -0.585 | -2.199 |
| 1.034999999999916 | 0.582 | -0.574 | -2.184 |
| 1.039999999999915 | 0.589 | -0.563 | -2.169 |
| 1.044999999999915 | 0.596 | -0.552 | -2.154 |
| 1.049999999999915 | 0.603 | -0.542 | -2.138 |
| 1.054999999999915 | 0.61 | -0.531 | -2.123 |
| 1.059999999999915 | 0.616 | -0.52 | -2.108 |
| 1.064999999999915 | 0.623 | -0.509 | -2.093 |
| 1.069999999999915 | 0.63 | -0.499 | -2.078 |
| 1.074999999999915 | 0.637 | -0.488 | -2.063 |
| 1.079999999999915 | 0.644 | -0.478 | -2.049 |
| 1.084999999999914 | 0.651 | -0.467 | -2.034 |
| 1.089999999999914 | 0.657 | -0.457 | -2.019 |
| 1.094999999999914 | 0.664 | -0.446 | -2.005 |
| 1.099999999999914 | 0.671 | -0.436 | -1.99 |
| 1.104999999999914 | 0.678 | -0.426 | -1.976 |
| 1.109999999999914 | 0.684 | -0.415 | -1.961 |
| 1.114999999999914 | 0.691 | -0.405 | -1.947 |
| 1.119999999999914 | 0.698 | -0.395 | -1.933 |
| 1.124999999999914 | 0.705 | -0.385 | -1.918 |
| 1.129999999999914 | 0.711 | -0.374 | -1.904 |
| 1.134999999999913 | 0.718 | -0.364 | -1.89 |
| 1.139999999999913 | 0.725 | -0.354 | -1.876 |
| 1.144999999999913 | 0.731 | -0.344 | -1.862 |
| 1.149999999999913 | 0.738 | -0.334 | -1.848 |
| 1.154999999999913 | 0.745 | -0.324 | -1.834 |
| 1.159999999999913 | 0.751 | -0.314 | -1.82 |
| 1.164999999999913 | 0.758 | -0.304 | -1.806 |
| 1.169999999999913 | 0.764 | -0.294 | -1.792 |
| 1.174999999999913 | 0.771 | -0.284 | -1.779 |
| 1.179999999999912 | 0.777 | -0.274 | -1.765 |
| 1.184999999999912 | 0.784 | -0.265 | -1.751 |
| 1.189999999999912 | 0.791 | -0.255 | -1.738 |
| 1.194999999999912 | 0.797 | -0.245 | -1.724 |
| 1.199999999999912 | 0.804 | -0.235 | -1.711 |
| 1.204999999999912 | 0.81 | -0.226 | -1.697 |
| 1.209999999999912 | 0.817 | -0.216 | -1.684 |
| 1.214999999999912 | 0.823 | -0.206 | -1.67 |
| 1.219999999999912 | 0.83 | -0.197 | -1.657 |
| 1.224999999999911 | 0.836 | -0.187 | -1.644 |
| 1.229999999999911 | 0.842 | -0.177 | -1.631 |
| 1.234999999999911 | 0.849 | -0.168 | -1.618 |
| 1.239999999999911 | 0.855 | -0.158 | -1.604 |
| 1.244999999999911 | 0.862 | -0.149 | -1.591 |
| 1.249999999999911 | 0.868 | -0.139 | -1.578 |
| 1.254999999999911 | 0.875 | -0.13 | -1.565 |
| 1.259999999999911 | 0.881 | -0.121 | -1.552 |
| 1.264999999999911 | 0.887 | -0.111 | -1.54 |
| 1.269999999999911 | 0.894 | -0.102 | -1.527 |
| 1.27499999999991 | 0.9 | -0.093 | -1.514 |
| 1.27999999999991 | 0.906 | -0.083 | -1.501 |
| 1.28499999999991 | 0.913 | -0.074 | -1.488 |
| 1.28999999999991 | 0.919 | -0.065 | -1.476 |
| 1.29499999999991 | 0.925 | -0.056 | -1.463 |
| 1.29999999999991 | 0.932 | -0.046 | -1.45 |
| 1.30499999999991 | 0.938 | -0.037 | -1.438 |
| 1.30999999999991 | 0.944 | -0.028 | -1.425 |
| 1.31499999999991 | 0.951 | -0.019 | -1.413 |
| 1.319999999999909 | 0.957 | -0.01 | -1.4 |
| 1.324999999999909 | 0.963 | -0.001 | -1.388 |
| 1.329999999999909 | 0.969 | 0.008 | -1.376 |
| 1.334999999999909 | 0.976 | 0.017 | -1.363 |
| 1.339999999999909 | 0.982 | 0.026 | -1.351 |
| 1.344999999999909 | 0.988 | 0.035 | -1.339 |
| 1.349999999999909 | 0.994 | 0.044 | -1.327 |
| 1.354999999999909 | 1.001 | 0.053 | -1.315 |
| 1.359999999999909 | 1.007 | 0.062 | -1.302 |
| 1.364999999999908 | 1.013 | 0.071 | -1.29 |
| 1.369999999999908 | 1.019 | 0.08 | -1.278 |
| 1.374999999999908 | 1.025 | 0.088 | -1.266 |
| 1.379999999999908 | 1.031 | 0.097 | -1.254 |
| 1.384999999999908 | 1.038 | 0.106 | -1.242 |
| 1.389999999999908 | 1.044 | 0.115 | -1.23 |
| 1.394999999999908 | 1.05 | 0.124 | -1.219 |
| 1.399999999999908 | 1.056 | 0.132 | -1.207 |
| 1.404999999999908 | 1.062 | 0.141 | -1.195 |
| 1.409999999999908 | 1.068 | 0.15 | -1.183 |
| 1.414999999999907 | 1.075 | 0.158 | -1.171 |
| 1.419999999999907 | 1.081 | 0.167 | -1.16 |
| 1.424999999999907 | 1.087 | 0.176 | -1.148 |
| 1.429999999999907 | 1.093 | 0.184 | -1.136 |
| 1.434999999999907 | 1.099 | 0.193 | -1.125 |
| 1.439999999999907 | 1.105 | 0.201 | -1.113 |
| 1.444999999999907 | 1.111 | 0.21 | -1.102 |
| 1.449999999999907 | 1.117 | 0.219 | -1.09 |
| 1.454999999999907 | 1.123 | 0.227 | -1.079 |
| 1.459999999999906 | 1.129 | 0.236 | -1.067 |
| 1.464999999999906 | 1.135 | 0.244 | -1.056 |
| 1.469999999999906 | 1.141 | 0.252 | -1.044 |
| 1.474999999999906 | 1.148 | 0.261 | -1.033 |
| 1.479999999999906 | 1.154 | 0.269 | -1.022 |
| 1.484999999999906 | 1.16 | 0.278 | -1.01 |
| 1.489999999999906 | 1.166 | 0.286 | -0.999 |
| 1.494999999999906 | 1.172 | 0.294 | -0.988 |
| 1.499999999999906 | 1.178 | 0.303 | -0.977 |
| 1.504999999999906 | 1.184 | 0.311 | -0.966 |
| 1.509999999999905 | 1.19 | 0.319 | -0.955 |
| 1.514999999999905 | 1.196 | 0.328 | -0.943 |
| 1.519999999999905 | 1.202 | 0.336 | -0.932 |
| 1.524999999999905 | 1.208 | 0.344 | -0.921 |
| 1.529999999999905 | 1.214 | 0.352 | -0.91 |
| 1.534999999999905 | 1.22 | 0.361 | -0.899 |
| 1.539999999999905 | 1.226 | 0.369 | -0.888 |
| 1.544999999999905 | 1.231 | 0.377 | -0.877 |
| 1.549999999999905 | 1.237 | 0.385 | -0.866 |
| 1.554999999999904 | 1.243 | 0.393 | -0.856 |
| 1.559999999999904 | 1.249 | 0.402 | -0.845 |
| 1.564999999999904 | 1.255 | 0.41 | -0.834 |
| 1.569999999999904 | 1.261 | 0.418 | -0.823 |
| 1.574999999999904 | 1.267 | 0.426 | -0.812 |
| 1.579999999999904 | 1.273 | 0.434 | -0.802 |
| 1.584999999999904 | 1.279 | 0.442 | -0.791 |
| 1.589999999999904 | 1.285 | 0.45 | -0.78 |
| 1.594999999999904 | 1.291 | 0.458 | -0.77 |
| 1.599999999999903 | 1.297 | 0.466 | -0.759 |
| 1.604999999999903 | 1.303 | 0.474 | -0.748 |
| 1.609999999999903 | 1.308 | 0.482 | -0.738 |
| 1.614999999999903 | 1.314 | 0.49 | -0.727 |
| 1.619999999999903 | 1.32 | 0.498 | -0.717 |
| 1.624999999999903 | 1.326 | 0.506 | -0.706 |
| 1.629999999999903 | 1.332 | 0.514 | -0.696 |
| 1.634999999999903 | 1.338 | 0.522 | -0.685 |
| 1.639999999999903 | 1.344 | 0.53 | -0.675 |
| 1.644999999999902 | 1.35 | 0.537 | -0.664 |
| 1.649999999999902 | 1.355 | 0.545 | -0.654 |
| 1.654999999999902 | 1.361 | 0.553 | -0.644 |
| 1.659999999999902 | 1.367 | 0.561 | -0.633 |
| 1.664999999999902 | 1.373 | 0.569 | -0.623 |
| 1.669999999999902 | 1.379 | 0.577 | -0.613 |
| 1.674999999999902 | 1.385 | 0.584 | -0.602 |
| 1.679999999999902 | 1.39 | 0.592 | -0.592 |
| 1.684999999999902 | 1.396 | 0.6 | -0.582 |
| 1.689999999999901 | 1.402 | 0.608 | -0.572 |
| 1.694999999999901 | 1.408 | 0.616 | -0.561 |
| 1.699999999999901 | 1.414 | 0.623 | -0.551 |
| 1.704999999999901 | 1.419 | 0.631 | -0.541 |
| 1.709999999999901 | 1.425 | 0.639 | -0.531 |
| 1.714999999999901 | 1.431 | 0.646 | -0.521 |
| 1.719999999999901 | 1.437 | 0.654 | -0.511 |
| 1.724999999999901 | 1.443 | 0.662 | -0.501 |
| 1.729999999999901 | 1.448 | 0.669 | -0.491 |
| 1.734999999999901 | 1.454 | 0.677 | -0.481 |
| 1.7399999999999 | 1.46 | 0.685 | -0.471 |
| 1.7449999999999 | 1.466 | 0.692 | -0.461 |
| 1.7499999999999 | 1.471 | 0.7 | -0.451 |
| 1.7549999999999 | 1.477 | 0.707 | -0.441 |
| 1.7599999999999 | 1.483 | 0.715 | -0.431 |
| 1.7649999999999 | 1.489 | 0.723 | -0.421 |
| 1.7699999999999 | 1.494 | 0.73 | -0.411 |
| 1.7749999999999 | 1.5 | 0.738 | -0.402 |
| 1.7799999999999 | 1.506 | 0.745 | -0.392 |
| 1.784999999999899 | 1.512 | 0.753 | -0.382 |
| 1.789999999999899 | 1.517 | 0.76 | -0.372 |
| 1.794999999999899 | 1.523 | 0.768 | -0.363 |
| 1.799999999999899 | 1.529 | 0.775 | -0.353 |
| 1.804999999999899 | 1.535 | 0.783 | -0.343 |
| 1.809999999999899 | 1.54 | 0.79 | -0.333 |
| 1.814999999999899 | 1.546 | 0.797 | -0.324 |
| 1.819999999999899 | 1.552 | 0.805 | -0.314 |
| 1.824999999999899 | 1.557 | 0.812 | -0.304 |
| 1.829999999999899 | 1.563 | 0.82 | -0.295 |
| 1.834999999999898 | 1.569 | 0.827 | -0.285 |
| 1.839999999999898 | 1.574 | 0.835 | -0.276 |
| 1.844999999999898 | 1.58 | 0.842 | -0.266 |
| 1.849999999999898 | 1.586 | 0.849 | -0.257 |
| 1.854999999999898 | 1.591 | 0.857 | -0.247 |
| 1.859999999999898 | 1.597 | 0.864 | -0.238 |
| 1.864999999999898 | 1.603 | 0.871 | -0.228 |
| 1.869999999999898 | 1.609 | 0.879 | -0.219 |
| 1.874999999999898 | 1.614 | 0.886 | -0.209 |
| 1.879999999999897 | 1.62 | 0.893 | -0.2 |
| 1.884999999999897 | 1.626 | 0.901 | -0.19 |
| 1.889999999999897 | 1.631 | 0.908 | -0.181 |
| 1.894999999999897 | 1.637 | 0.915 | -0.172 |
| 1.899999999999897 | 1.642 | 0.922 | -0.162 |
| 1.904999999999897 | 1.648 | 0.93 | -0.153 |
| 1.909999999999897 | 1.654 | 0.937 | -0.144 |
| 1.914999999999897 | 1.659 | 0.944 | -0.134 |
| 1.919999999999897 | 1.665 | 0.951 | -0.125 |
| 1.924999999999897 | 1.671 | 0.959 | -0.116 |
| 1.929999999999896 | 1.676 | 0.966 | -0.107 |
| 1.934999999999896 | 1.682 | 0.973 | -0.097 |
| 1.939999999999896 | 1.688 | 0.98 | -0.088 |
| 1.944999999999896 | 1.693 | 0.987 | -0.079 |
| 1.949999999999896 | 1.699 | 0.995 | -0.07 |
| 1.954999999999896 | 1.704 | 1.002 | -0.061 |
| 1.959999999999896 | 1.71 | 1.009 | -0.051 |
| 1.964999999999896 | 1.716 | 1.016 | -0.042 |
| 1.969999999999896 | 1.721 | 1.023 | -0.033 |
| 1.974999999999895 | 1.727 | 1.03 | -0.024 |
| 1.979999999999895 | 1.732 | 1.037 | -0.015 |
| 1.984999999999895 | 1.738 | 1.044 | -0.006 |
| 1.989999999999895 | 1.744 | 1.052 | 0.003 |
| 1.994999999999895 | 1.749 | 1.059 | 0.012 |
| 1.999999999999895 | 1.755 | 1.066 | 0.021 |
| 2.004999999999895 | 1.76 | 1.073 | 0.03 |
| 2.009999999999895 | 1.766 | 1.08 | 0.039 |
| 2.014999999999895 | 1.772 | 1.087 | 0.048 |
| 2.019999999999895 | 1.777 | 1.094 | 0.057 |
| 2.024999999999895 | 1.783 | 1.101 | 0.066 |
| 2.029999999999895 | 1.788 | 1.108 | 0.075 |
| 2.034999999999894 | 1.794 | 1.115 | 0.084 |
| 2.039999999999894 | 1.799 | 1.122 | 0.093 |
| 2.044999999999894 | 1.805 | 1.129 | 0.102 |
| 2.049999999999894 | 1.811 | 1.136 | 0.111 |
| 2.054999999999894 | 1.816 | 1.143 | 0.119 |
| 2.059999999999894 | 1.822 | 1.15 | 0.128 |
| 2.064999999999894 | 1.827 | 1.157 | 0.137 |
| 2.069999999999894 | 1.833 | 1.164 | 0.146 |
| 2.074999999999894 | 1.838 | 1.171 | 0.155 |
| 2.079999999999893 | 1.844 | 1.178 | 0.164 |
| 2.084999999999893 | 1.85 | 1.185 | 0.172 |
| 2.089999999999893 | 1.855 | 1.192 | 0.181 |
| 2.094999999999893 | 1.861 | 1.198 | 0.19 |
| 2.099999999999893 | 1.866 | 1.205 | 0.199 |
| 2.104999999999893 | 1.872 | 1.212 | 0.207 |
| 2.109999999999893 | 1.877 | 1.219 | 0.216 |
| 2.114999999999893 | 1.883 | 1.226 | 0.225 |
| 2.119999999999893 | 1.888 | 1.233 | 0.233 |
| 2.124999999999893 | 1.894 | 1.24 | 0.242 |
| 2.129999999999892 | 1.899 | 1.247 | 0.251 |
| 2.134999999999892 | 1.905 | 1.254 | 0.259 |
| 2.139999999999892 | 1.91 | 1.26 | 0.268 |
| 2.144999999999892 | 1.916 | 1.267 | 0.276 |
| 2.149999999999892 | 1.921 | 1.274 | 0.285 |
| 2.154999999999892 | 1.927 | 1.281 | 0.294 |
| 2.159999999999892 | 1.932 | 1.288 | 0.302 |
| 2.164999999999892 | 1.938 | 1.295 | 0.311 |
| 2.169999999999892 | 1.943 | 1.301 | 0.319 |
| 2.174999999999891 | 1.949 | 1.308 | 0.328 |
| 2.179999999999891 | 1.954 | 1.315 | 0.336 |
| 2.184999999999891 | 1.96 | 1.322 | 0.345 |
| 2.189999999999891 | 1.965 | 1.328 | 0.353 |
| 2.194999999999891 | 1.971 | 1.335 | 0.362 |
| 2.199999999999891 | 1.976 | 1.342 | 0.37 |
| 2.204999999999891 | 1.982 | 1.349 | 0.379 |
| 2.209999999999891 | 1.987 | 1.355 | 0.387 |
| 2.214999999999891 | 1.993 | 1.362 | 0.396 |
| 2.21999999999989 | 1.998 | 1.369 | 0.404 |
| 2.22499999999989 | 2.004 | 1.376 | 0.412 |
| 2.22999999999989 | 2.009 | 1.382 | 0.421 |
| 2.23499999999989 | 2.015 | 1.389 | 0.429 |
| 2.23999999999989 | 2.02 | 1.396 | 0.437 |
| 2.24499999999989 | 2.026 | 1.403 | 0.446 |
| 2.24999999999989 | 2.031 | 1.409 | 0.454 |
| 2.25499999999989 | 2.037 | 1.416 | 0.462 |
| 2.25999999999989 | 2.042 | 1.423 | 0.471 |
| 2.26499999999989 | 2.048 | 1.429 | 0.479 |
| 2.269999999999889 | 2.053 | 1.436 | 0.487 |
| 2.274999999999889 | 2.059 | 1.443 | 0.496 |
| 2.279999999999889 | 2.064 | 1.449 | 0.504 |
| 2.284999999999889 | 2.069 | 1.456 | 0.512 |
| 2.289999999999889 | 2.075 | 1.463 | 0.52 |
| 2.294999999999889 | 2.08 | 1.469 | 0.529 |
| 2.299999999999889 | 2.086 | 1.476 | 0.537 |
| 2.304999999999889 | 2.091 | 1.482 | 0.545 |
| 2.309999999999889 | 2.097 | 1.489 | 0.553 |
| 2.314999999999888 | 2.102 | 1.496 | 0.562 |
| 2.319999999999888 | 2.108 | 1.502 | 0.57 |
| 2.324999999999888 | 2.113 | 1.509 | 0.578 |
| 2.329999999999888 | 2.119 | 1.515 | 0.586 |
| 2.334999999999888 | 2.124 | 1.522 | 0.594 |
| 2.339999999999888 | 2.129 | 1.529 | 0.602 |
| 2.344999999999888 | 2.135 | 1.535 | 0.61 |
| 2.349999999999888 | 2.14 | 1.542 | 0.619 |
| 2.354999999999888 | 2.146 | 1.548 | 0.627 |
| 2.359999999999887 | 2.151 | 1.555 | 0.635 |
| 2.364999999999887 | 2.157 | 1.561 | 0.643 |
| 2.369999999999887 | 2.162 | 1.568 | 0.651 |
| 2.374999999999887 | 2.167 | 1.575 | 0.659 |
| 2.379999999999887 | 2.173 | 1.581 | 0.667 |
| 2.384999999999887 | 2.178 | 1.588 | 0.675 |
| 2.389999999999887 | 2.184 | 1.594 | 0.683 |
| 2.394999999999887 | 2.189 | 1.601 | 0.691 |
| 2.399999999999887 | 2.195 | 1.607 | 0.699 |
| 2.404999999999887 | 2.2 | 1.614 | 0.707 |
| 2.409999999999886 | 2.205 | 1.62 | 0.715 |
| 2.414999999999886 | 2.211 | 1.627 | 0.723 |
| 2.419999999999886 | 2.216 | 1.633 | 0.731 |
| 2.424999999999886 | 2.222 | 1.64 | 0.739 |
| 2.429999999999886 | 2.227 | 1.646 | 0.747 |
| 2.434999999999886 | 2.232 | 1.653 | 0.755 |
| 2.439999999999886 | 2.238 | 1.659 | 0.763 |
| 2.444999999999886 | 2.243 | 1.665 | 0.771 |
| 2.449999999999886 | 2.249 | 1.672 | 0.779 |
| 2.454999999999885 | 2.254 | 1.678 | 0.787 |
| 2.459999999999885 | 2.259 | 1.685 | 0.794 |
| 2.464999999999885 | 2.265 | 1.691 | 0.802 |
| 2.469999999999885 | 2.27 | 1.698 | 0.81 |
| 2.474999999999885 | 2.276 | 1.704 | 0.818 |
| 2.479999999999885 | 2.281 | 1.711 | 0.826 |
| 2.484999999999885 | 2.286 | 1.717 | 0.834 |
| 2.489999999999885 | 2.292 | 1.723 | 0.842 |
| 2.494999999999885 | 2.297 | 1.73 | 0.849 |
| 2.499999999999884 | 2.303 | 1.736 | 0.857 |
| 2.504999999999884 | 2.308 | 1.743 | 0.865 |
| 2.509999999999884 | 2.313 | 1.749 | 0.873 |
| 2.514999999999884 | 2.319 | 1.755 | 0.881 |
| 2.519999999999884 | 2.324 | 1.762 | 0.888 |
| 2.524999999999884 | 2.329 | 1.768 | 0.896 |
| 2.529999999999884 | 2.335 | 1.775 | 0.904 |
| 2.534999999999884 | 2.34 | 1.781 | 0.912 |
| 2.539999999999884 | 2.346 | 1.787 | 0.919 |
| 2.544999999999884 | 2.351 | 1.794 | 0.927 |
| 2.549999999999883 | 2.356 | 1.8 | 0.935 |
| 2.554999999999883 | 2.362 | 1.806 | 0.943 |
| 2.559999999999883 | 2.367 | 1.813 | 0.95 |
| 2.564999999999883 | 2.372 | 1.819 | 0.958 |
| 2.569999999999883 | 2.378 | 1.825 | 0.966 |
| 2.574999999999883 | 2.383 | 1.832 | 0.973 |
| 2.579999999999883 | 2.389 | 1.838 | 0.981 |
| 2.584999999999883 | 2.394 | 1.844 | 0.989 |
| 2.589999999999883 | 2.399 | 1.851 | 0.996 |
| 2.594999999999882 | 2.405 | 1.857 | 1.004 |
| 2.599999999999882 | 2.41 | 1.863 | 1.012 |
| 2.604999999999882 | 2.415 | 1.87 | 1.019 |
| 2.609999999999882 | 2.421 | 1.876 | 1.027 |
| 2.614999999999882 | 2.426 | 1.882 | 1.034 |
| 2.619999999999882 | 2.431 | 1.889 | 1.042 |
| 2.624999999999882 | 2.437 | 1.895 | 1.05 |
| 2.629999999999882 | 2.442 | 1.901 | 1.057 |
| 2.634999999999882 | 2.447 | 1.907 | 1.065 |
| 2.639999999999881 | 2.453 | 1.914 | 1.072 |
| 2.644999999999881 | 2.458 | 1.92 | 1.08 |
| 2.649999999999881 | 2.463 | 1.926 | 1.088 |
| 2.654999999999881 | 2.469 | 1.932 | 1.095 |
| 2.659999999999881 | 2.474 | 1.939 | 1.103 |
| 2.664999999999881 | 2.479 | 1.945 | 1.11 |
| 2.669999999999881 | 2.485 | 1.951 | 1.118 |
| 2.674999999999881 | 2.49 | 1.957 | 1.125 |
| 2.679999999999881 | 2.496 | 1.964 | 1.133 |
| 2.68499999999988 | 2.501 | 1.97 | 1.14 |
| 2.68999999999988 | 2.506 | 1.976 | 1.148 |
| 2.69499999999988 | 2.512 | 1.982 | 1.155 |
| 2.69999999999988 | 2.517 | 1.989 | 1.163 |
| 2.70499999999988 | 2.522 | 1.995 | 1.17 |
| 2.70999999999988 | 2.528 | 2.001 | 1.178 |
| 2.71499999999988 | 2.533 | 2.007 | 1.185 |
| 2.71999999999988 | 2.538 | 2.013 | 1.193 |
| 2.72499999999988 | 2.543 | 2.02 | 1.2 |
| 2.72999999999988 | 2.549 | 2.026 | 1.207 |
| 2.734999999999879 | 2.554 | 2.032 | 1.215 |
| 2.739999999999879 | 2.559 | 2.038 | 1.222 |
| 2.744999999999879 | 2.565 | 2.044 | 1.23 |
| 2.749999999999879 | 2.57 | 2.051 | 1.237 |
| 2.754999999999879 | 2.575 | 2.057 | 1.244 |
| 2.759999999999879 | 2.581 | 2.063 | 1.252 |
| 2.764999999999879 | 2.586 | 2.069 | 1.259 |
| 2.769999999999879 | 2.591 | 2.075 | 1.267 |
| 2.774999999999879 | 2.597 | 2.081 | 1.274 |
| 2.779999999999878 | 2.602 | 2.088 | 1.281 |
| 2.784999999999878 | 2.607 | 2.094 | 1.289 |
| 2.789999999999878 | 2.613 | 2.1 | 1.296 |
| 2.794999999999878 | 2.618 | 2.106 | 1.303 |
| 2.799999999999878 | 2.623 | 2.112 | 1.311 |
| 2.804999999999878 | 2.629 | 2.118 | 1.318 |
| 2.809999999999878 | 2.634 | 2.125 | 1.325 |
| 2.814999999999878 | 2.639 | 2.131 | 1.333 |
| 2.819999999999878 | 2.644 | 2.137 | 1.34 |
| 2.824999999999878 | 2.65 | 2.143 | 1.347 |
| 2.829999999999877 | 2.655 | 2.149 | 1.355 |
| 2.834999999999877 | 2.66 | 2.155 | 1.362 |
| 2.839999999999877 | 2.666 | 2.161 | 1.369 |
| 2.844999999999877 | 2.671 | 2.167 | 1.376 |
| 2.849999999999877 | 2.676 | 2.174 | 1.384 |
| 2.854999999999877 | 2.682 | 2.18 | 1.391 |
| 2.859999999999877 | 2.687 | 2.186 | 1.398 |
| 2.864999999999877 | 2.692 | 2.192 | 1.405 |
| 2.869999999999877 | 2.697 | 2.198 | 1.413 |
| 2.874999999999876 | 2.703 | 2.204 | 1.42 |
| 2.879999999999876 | 2.708 | 2.21 | 1.427 |
| 2.884999999999876 | 2.713 | 2.216 | 1.434 |
| 2.889999999999876 | 2.719 | 2.222 | 1.441 |
| 2.894999999999876 | 2.724 | 2.228 | 1.449 |
| 2.899999999999876 | 2.729 | 2.234 | 1.456 |
| 2.904999999999876 | 2.735 | 2.241 | 1.463 |
| 2.909999999999876 | 2.74 | 2.247 | 1.47 |
| 2.914999999999876 | 2.745 | 2.253 | 1.477 |
| 2.919999999999876 | 2.75 | 2.259 | 1.485 |
| 2.924999999999875 | 2.756 | 2.265 | 1.492 |
| 2.929999999999875 | 2.761 | 2.271 | 1.499 |
| 2.934999999999875 | 2.766 | 2.277 | 1.506 |
| 2.939999999999875 | 2.772 | 2.283 | 1.513 |
| 2.944999999999875 | 2.777 | 2.289 | 1.52 |
| 2.949999999999875 | 2.782 | 2.295 | 1.528 |
| 2.954999999999875 | 2.787 | 2.301 | 1.535 |
| 2.959999999999875 | 2.793 | 2.307 | 1.542 |
| 2.964999999999875 | 2.798 | 2.313 | 1.549 |
| 2.969999999999874 | 2.803 | 2.319 | 1.556 |
| 2.974999999999874 | 2.808 | 2.325 | 1.563 |
| 2.979999999999874 | 2.814 | 2.331 | 1.57 |
| 2.984999999999874 | 2.819 | 2.337 | 1.577 |
| 2.989999999999874 | 2.824 | 2.343 | 1.584 |
| 2.994999999999874 | 2.83 | 2.349 | 1.591 |
| 2.999999999999874 | 2.835 | 2.355 | 1.599 |
| 3.004999999999874 | 2.84 | 2.361 | 1.606 |
| 3.009999999999874 | 2.845 | 2.367 | 1.613 |
| 3.014999999999874 | 2.851 | 2.373 | 1.62 |
| 3.019999999999873 | 2.856 | 2.379 | 1.627 |
| 3.024999999999873 | 2.861 | 2.385 | 1.634 |
| 3.029999999999873 | 2.866 | 2.391 | 1.641 |
| 3.034999999999873 | 2.872 | 2.397 | 1.648 |
| 3.039999999999873 | 2.877 | 2.403 | 1.655 |
| 3.044999999999873 | 2.882 | 2.409 | 1.662 |
| 3.049999999999873 | 2.887 | 2.415 | 1.669 |
| 3.054999999999873 | 2.893 | 2.421 | 1.676 |
| 3.059999999999873 | 2.898 | 2.427 | 1.683 |
| 3.064999999999872 | 2.903 | 2.433 | 1.69 |
| 3.069999999999872 | 2.909 | 2.439 | 1.697 |
| 3.074999999999872 | 2.914 | 2.445 | 1.704 |
| 3.079999999999872 | 2.919 | 2.451 | 1.711 |
| 3.084999999999872 | 2.924 | 2.457 | 1.718 |
| 3.089999999999872 | 2.93 | 2.463 | 1.725 |
| 3.094999999999872 | 2.935 | 2.469 | 1.732 |
| 3.099999999999872 | 2.94 | 2.475 | 1.739 |
| 3.104999999999872 | 2.945 | 2.481 | 1.746 |
| 3.109999999999872 | 2.951 | 2.487 | 1.753 |
| 3.114999999999871 | 2.956 | 2.493 | 1.76 |
| 3.119999999999871 | 2.961 | 2.499 | 1.767 |
| 3.124999999999871 | 2.966 | 2.505 | 1.774 |
| 3.129999999999871 | 2.972 | 2.51 | 1.78 |
| 3.134999999999871 | 2.977 | 2.516 | 1.787 |
| 3.139999999999871 | 2.982 | 2.522 | 1.794 |
| 3.144999999999871 | 2.987 | 2.528 | 1.801 |
| 3.149999999999871 | 2.993 | 2.534 | 1.808 |
| 3.154999999999871 | 2.998 | 2.54 | 1.815 |
| 3.15999999999987 | 3.003 | 2.546 | 1.822 |
| 3.16499999999987 | 3.008 | 2.552 | 1.829 |
| 3.16999999999987 | 3.014 | 2.558 | 1.836 |
| 3.17499999999987 | 3.019 | 2.564 | 1.843 |
| 3.17999999999987 | 3.024 | 2.57 | 1.849 |
| 3.18499999999987 | 3.029 | 2.576 | 1.856 |
| 3.18999999999987 | 3.035 | 2.582 | 1.863 |
| 3.19499999999987 | 3.04 | 2.587 | 1.87 |
| 3.19999999999987 | 3.045 | 2.593 | 1.877 |
| 3.204999999999869 | 3.05 | 2.599 | 1.884 |
| 3.209999999999869 | 3.055 | 2.605 | 1.891 |
| 3.214999999999869 | 3.061 | 2.611 | 1.897 |
| 3.219999999999869 | 3.066 | 2.617 | 1.904 |
| 3.224999999999869 | 3.071 | 2.623 | 1.911 |
| 3.229999999999869 | 3.076 | 2.629 | 1.918 |
| 3.234999999999869 | 3.082 | 2.635 | 1.925 |
| 3.239999999999869 | 3.087 | 2.64 | 1.932 |
| 3.244999999999869 | 3.092 | 2.646 | 1.938 |
| 3.249999999999869 | 3.097 | 2.652 | 1.945 |
| 3.254999999999868 | 3.103 | 2.658 | 1.952 |
| 3.259999999999868 | 3.108 | 2.664 | 1.959 |
| 3.264999999999868 | 3.113 | 2.67 | 1.966 |
| 3.269999999999868 | 3.118 | 2.676 | 1.972 |
| 3.274999999999868 | 3.123 | 2.681 | 1.979 |
| 3.279999999999868 | 3.129 | 2.687 | 1.986 |
| 3.284999999999868 | 3.134 | 2.693 | 1.993 |
| 3.289999999999868 | 3.139 | 2.699 | 1.999 |
| 3.294999999999868 | 3.144 | 2.705 | 2.006 |
| 3.299999999999867 | 3.15 | 2.711 | 2.013 |
| 3.304999999999867 | 3.155 | 2.717 | 2.02 |
| 3.309999999999867 | 3.16 | 2.722 | 2.026 |
| 3.314999999999867 | 3.165 | 2.728 | 2.033 |
| 3.319999999999867 | 3.171 | 2.734 | 2.04 |
| 3.324999999999867 | 3.176 | 2.74 | 2.047 |
| 3.329999999999867 | 3.181 | 2.746 | 2.053 |
| 3.334999999999867 | 3.186 | 2.752 | 2.06 |
| 3.339999999999867 | 3.191 | 2.757 | 2.067 |
| 3.344999999999866 | 3.197 | 2.763 | 2.074 |
| 3.349999999999866 | 3.202 | 2.769 | 2.08 |
| 3.354999999999866 | 3.207 | 2.775 | 2.087 |
| 3.359999999999866 | 3.212 | 2.781 | 2.094 |
| 3.364999999999866 | 3.217 | 2.787 | 2.1 |
| 3.369999999999866 | 3.223 | 2.792 | 2.107 |
| 3.374999999999866 | 3.228 | 2.798 | 2.114 |
| 3.379999999999866 | 3.233 | 2.804 | 2.121 |
| 3.384999999999866 | 3.238 | 2.81 | 2.127 |
| 3.389999999999866 | 3.244 | 2.816 | 2.134 |
| 3.394999999999865 | 3.249 | 2.821 | 2.141 |
| 3.399999999999865 | 3.254 | 2.827 | 2.147 |
| 3.404999999999865 | 3.259 | 2.833 | 2.154 |
| 3.409999999999865 | 3.264 | 2.839 | 2.161 |
| 3.414999999999865 | 3.27 | 2.845 | 2.167 |
| 3.419999999999865 | 3.275 | 2.85 | 2.174 |
| 3.424999999999865 | 3.28 | 2.856 | 2.181 |
| 3.429999999999865 | 3.285 | 2.862 | 2.187 |
| 3.434999999999865 | 3.29 | 2.868 | 2.194 |
| 3.439999999999864 | 3.296 | 2.874 | 2.2 |
| 3.444999999999864 | 3.301 | 2.879 | 2.207 |
| 3.449999999999864 | 3.306 | 2.885 | 2.214 |
| 3.454999999999864 | 3.311 | 2.891 | 2.22 |
| 3.459999999999864 | 3.316 | 2.897 | 2.227 |
| 3.464999999999864 | 3.322 | 2.902 | 2.234 |
| 3.469999999999864 | 3.327 | 2.908 | 2.24 |
| 3.474999999999864 | 3.332 | 2.914 | 2.247 |
| 3.479999999999864 | 3.337 | 2.92 | 2.253 |
| 3.484999999999864 | 3.342 | 2.926 | 2.26 |
| 3.489999999999863 | 3.348 | 2.931 | 2.267 |
| 3.494999999999863 | 3.353 | 2.937 | 2.273 |
| 3.499999999999863 | 3.358 | 2.943 | 2.28 |
| 3.504999999999863 | 3.363 | 2.949 | 2.286 |
| 3.509999999999863 | 3.368 | 2.954 | 2.293 |
| 3.514999999999863 | 3.374 | 2.96 | 2.299 |
| 3.519999999999863 | 3.379 | 2.966 | 2.306 |
| 3.524999999999863 | 3.384 | 2.972 | 2.313 |
| 3.529999999999863 | 3.389 | 2.977 | 2.319 |
| 3.534999999999862 | 3.394 | 2.983 | 2.326 |
| 3.539999999999862 | 3.4 | 2.989 | 2.332 |
| 3.544999999999862 | 3.405 | 2.995 | 2.339 |
| 3.549999999999862 | 3.41 | 3 | 2.345 |
| 3.554999999999862 | 3.415 | 3.006 | 2.352 |
| 3.559999999999862 | 3.42 | 3.012 | 2.359 |
| 3.564999999999862 | 3.426 | 3.017 | 2.365 |
| 3.569999999999862 | 3.431 | 3.023 | 2.372 |
| 3.574999999999862 | 3.436 | 3.029 | 2.378 |
| 3.579999999999862 | 3.441 | 3.035 | 2.385 |
| 3.584999999999861 | 3.446 | 3.04 | 2.391 |
| 3.589999999999861 | 3.452 | 3.046 | 2.398 |
| 3.594999999999861 | 3.457 | 3.052 | 2.404 |
| 3.599999999999861 | 3.462 | 3.058 | 2.411 |
| 3.604999999999861 | 3.467 | 3.063 | 2.417 |
| 3.609999999999861 | 3.472 | 3.069 | 2.424 |
| 3.614999999999861 | 3.478 | 3.075 | 2.43 |
| 3.619999999999861 | 3.483 | 3.08 | 2.437 |
| 3.62499999999986 | 3.488 | 3.086 | 2.443 |
| 3.62999999999986 | 3.493 | 3.092 | 2.45 |
| 3.63499999999986 | 3.498 | 3.098 | 2.456 |
| 3.63999999999986 | 3.503 | 3.103 | 2.463 |
| 3.64499999999986 | 3.509 | 3.109 | 2.469 |
| 3.64999999999986 | 3.514 | 3.115 | 2.476 |
| 3.65499999999986 | 3.519 | 3.12 | 2.482 |
| 3.65999999999986 | 3.524 | 3.126 | 2.489 |
| 3.66499999999986 | 3.529 | 3.132 | 2.495 |
| 3.669999999999859 | 3.535 | 3.137 | 2.501 |
| 3.674999999999859 | 3.54 | 3.143 | 2.508 |
| 3.679999999999859 | 3.545 | 3.149 | 2.514 |
| 3.684999999999859 | 3.55 | 3.155 | 2.521 |
| 3.689999999999859 | 3.555 | 3.16 | 2.527 |
| 3.694999999999859 | 3.56 | 3.166 | 2.534 |
| 3.699999999999859 | 3.566 | 3.172 | 2.54 |
| 3.704999999999859 | 3.571 | 3.177 | 2.547 |
| 3.709999999999859 | 3.576 | 3.183 | 2.553 |
| 3.714999999999859 | 3.581 | 3.189 | 2.559 |
| 3.719999999999858 | 3.586 | 3.194 | 2.566 |
| 3.724999999999858 | 3.592 | 3.2 | 2.572 |
| 3.729999999999858 | 3.597 | 3.206 | 2.579 |
| 3.734999999999858 | 3.602 | 3.211 | 2.585 |
| 3.739999999999858 | 3.607 | 3.217 | 2.592 |
| 3.744999999999858 | 3.612 | 3.223 | 2.598 |
| 3.749999999999858 | 3.617 | 3.228 | 2.604 |
| 3.754999999999858 | 3.623 | 3.234 | 2.611 |
| 3.759999999999858 | 3.628 | 3.24 | 2.617 |
| 3.764999999999857 | 3.633 | 3.245 | 2.624 |
| 3.769999999999857 | 3.638 | 3.251 | 2.63 |
| 3.774999999999857 | 3.643 | 3.257 | 2.636 |
| 3.779999999999857 | 3.648 | 3.262 | 2.643 |
| 3.784999999999857 | 3.654 | 3.268 | 2.649 |
| 3.789999999999857 | 3.659 | 3.274 | 2.655 |
| 3.794999999999857 | 3.664 | 3.279 | 2.662 |
| 3.799999999999857 | 3.669 | 3.285 | 2.668 |
| 3.804999999999857 | 3.674 | 3.291 | 2.675 |
| 3.809999999999857 | 3.68 | 3.296 | 2.681 |
| 3.814999999999856 | 3.685 | 3.302 | 2.687 |
| 3.819999999999856 | 3.69 | 3.308 | 2.694 |
| 3.824999999999856 | 3.695 | 3.313 | 2.7 |
| 3.829999999999856 | 3.7 | 3.319 | 2.706 |
| 3.834999999999856 | 3.705 | 3.324 | 2.713 |
| 3.839999999999856 | 3.711 | 3.33 | 2.719 |
| 3.844999999999856 | 3.716 | 3.336 | 2.725 |
| 3.849999999999856 | 3.721 | 3.341 | 2.732 |
| 3.854999999999856 | 3.726 | 3.347 | 2.738 |
| 3.859999999999855 | 3.731 | 3.353 | 2.744 |
| 3.864999999999855 | 3.736 | 3.358 | 2.751 |
| 3.869999999999855 | 3.742 | 3.364 | 2.757 |
| 3.874999999999855 | 3.747 | 3.37 | 2.763 |
| 3.879999999999855 | 3.752 | 3.375 | 2.77 |
| 3.884999999999855 | 3.757 | 3.381 | 2.776 |
| 3.889999999999855 | 3.762 | 3.386 | 2.782 |
| 3.894999999999855 | 3.767 | 3.392 | 2.789 |
| 3.899999999999855 | 3.772 | 3.398 | 2.795 |
| 3.904999999999855 | 3.778 | 3.403 | 2.801 |
| 3.909999999999854 | 3.783 | 3.409 | 2.808 |
| 3.914999999999854 | 3.788 | 3.414 | 2.814 |
| 3.919999999999854 | 3.793 | 3.42 | 2.82 |
| 3.924999999999854 | 3.798 | 3.426 | 2.826 |
| 3.929999999999854 | 3.803 | 3.431 | 2.833 |
| 3.934999999999854 | 3.809 | 3.437 | 2.839 |
| 3.939999999999854 | 3.814 | 3.443 | 2.845 |
| 3.944999999999854 | 3.819 | 3.448 | 2.852 |
| 3.949999999999854 | 3.824 | 3.454 | 2.858 |
| 3.954999999999853 | 3.829 | 3.459 | 2.864 |
| 3.959999999999853 | 3.834 | 3.465 | 2.87 |
| 3.964999999999853 | 3.84 | 3.471 | 2.877 |
| 3.969999999999853 | 3.845 | 3.476 | 2.883 |
| 3.974999999999853 | 3.85 | 3.482 | 2.889 |
| 3.979999999999853 | 3.855 | 3.487 | 2.896 |
| 3.984999999999853 | 3.86 | 3.493 | 2.902 |
| 3.989999999999853 | 3.865 | 3.499 | 2.908 |
| 3.994999999999853 | 3.87 | 3.504 | 2.914 |
| 3.999999999999853 | 3.876 | 3.51 | 2.921 |
| 4.004999999999852 | 3.881 | 3.515 | 2.927 |
| 4.009999999999852 | 3.886 | 3.521 | 2.933 |
| 4.014999999999852 | 3.891 | 3.526 | 2.939 |
| 4.019999999999852 | 3.896 | 3.532 | 2.946 |
| 4.024999999999852 | 3.901 | 3.538 | 2.952 |
| 4.029999999999852 | 3.907 | 3.543 | 2.958 |
| 4.034999999999852 | 3.912 | 3.549 | 2.964 |
| 4.039999999999851 | 3.917 | 3.554 | 2.97 |
| 4.044999999999852 | 3.922 | 3.56 | 2.977 |
| 4.049999999999851 | 3.927 | 3.566 | 2.983 |
| 4.054999999999851 | 3.932 | 3.571 | 2.989 |
| 4.059999999999851 | 3.937 | 3.577 | 2.995 |
| 4.064999999999851 | 3.943 | 3.582 | 3.002 |
| 4.069999999999851 | 3.948 | 3.588 | 3.008 |
| 4.074999999999851 | 3.953 | 3.593 | 3.014 |
| 4.07999999999985 | 3.958 | 3.599 | 3.02 |
| 4.084999999999851 | 3.963 | 3.605 | 3.026 |
| 4.08999999999985 | 3.968 | 3.61 | 3.033 |
| 4.094999999999851 | 3.973 | 3.616 | 3.039 |
| 4.09999999999985 | 3.979 | 3.621 | 3.045 |
| 4.10499999999985 | 3.984 | 3.627 | 3.051 |
| 4.10999999999985 | 3.989 | 3.632 | 3.057 |
| 4.11499999999985 | 3.994 | 3.638 | 3.064 |
| 4.11999999999985 | 3.999 | 3.643 | 3.07 |
| 4.12499999999985 | 4.004 | 3.649 | 3.076 |
| 4.12999999999985 | 4.01 | 3.655 | 3.082 |
| 4.13499999999985 | 4.015 | 3.66 | 3.088 |
| 4.13999999999985 | 4.02 | 3.666 | 3.094 |
| 4.144999999999849 | 4.025 | 3.671 | 3.101 |
| 4.14999999999985 | 4.03 | 3.677 | 3.107 |
| 4.154999999999849 | 4.035 | 3.682 | 3.113 |
| 4.15999999999985 | 4.04 | 3.688 | 3.119 |
| 4.164999999999849 | 4.046 | 3.693 | 3.125 |
| 4.169999999999849 | 4.051 | 3.699 | 3.131 |
| 4.174999999999849 | 4.056 | 3.705 | 3.138 |
| 4.179999999999848 | 4.061 | 3.71 | 3.144 |
| 4.184999999999849 | 4.066 | 3.716 | 3.15 |
| 4.189999999999848 | 4.071 | 3.721 | 3.156 |
| 4.194999999999848 | 4.076 | 3.727 | 3.162 |
| 4.199999999999848 | 4.082 | 3.732 | 3.168 |
| 4.204999999999848 | 4.087 | 3.738 | 3.175 |
| 4.209999999999848 | 4.092 | 3.743 | 3.181 |
| 4.214999999999848 | 4.097 | 3.749 | 3.187 |
| 4.219999999999847 | 4.102 | 3.754 | 3.193 |
| 4.224999999999848 | 4.107 | 3.76 | 3.199 |
| 4.229999999999847 | 4.112 | 3.765 | 3.205 |
| 4.234999999999847 | 4.117 | 3.771 | 3.211 |
| 4.239999999999847 | 4.123 | 3.777 | 3.217 |
| 4.244999999999847 | 4.128 | 3.782 | 3.224 |
| 4.249999999999847 | 4.133 | 3.788 | 3.23 |
| 4.254999999999847 | 4.138 | 3.793 | 3.236 |
| 4.259999999999846 | 4.143 | 3.799 | 3.242 |
| 4.264999999999847 | 4.148 | 3.804 | 3.248 |
| 4.269999999999846 | 4.153 | 3.81 | 3.254 |
| 4.274999999999846 | 4.159 | 3.815 | 3.26 |
| 4.279999999999846 | 4.164 | 3.821 | 3.266 |
| 4.284999999999846 | 4.169 | 3.826 | 3.273 |
| 4.289999999999846 | 4.174 | 3.832 | 3.279 |
| 4.294999999999846 | 4.179 | 3.837 | 3.285 |
| 4.299999999999846 | 4.184 | 3.843 | 3.291 |
| 4.304999999999846 | 4.189 | 3.848 | 3.297 |
| 4.309999999999845 | 4.195 | 3.854 | 3.303 |
| 4.314999999999846 | 4.2 | 3.859 | 3.309 |
| 4.319999999999845 | 4.205 | 3.865 | 3.315 |
| 4.324999999999846 | 4.21 | 3.87 | 3.321 |
| 4.329999999999845 | 4.215 | 3.876 | 3.327 |
| 4.334999999999845 | 4.22 | 3.881 | 3.333 |
| 4.339999999999845 | 4.225 | 3.887 | 3.34 |
| 4.344999999999845 | 4.23 | 3.892 | 3.346 |
| 4.349999999999845 | 4.236 | 3.898 | 3.352 |
| 4.354999999999845 | 4.241 | 3.903 | 3.358 |
| 4.359999999999844 | 4.246 | 3.909 | 3.364 |
| 4.364999999999845 | 4.251 | 3.914 | 3.37 |
| 4.369999999999844 | 4.256 | 3.92 | 3.376 |
| 4.374999999999844 | 4.261 | 3.925 | 3.382 |
| 4.379999999999844 | 4.266 | 3.931 | 3.388 |
| 4.384999999999844 | 4.271 | 3.936 | 3.394 |
| 4.389999999999844 | 4.277 | 3.942 | 3.4 |
| 4.394999999999844 | 4.282 | 3.947 | 3.406 |
| 4.399999999999844 | 4.287 | 3.953 | 3.412 |
| 4.404999999999844 | 4.292 | 3.958 | 3.418 |
| 4.409999999999843 | 4.297 | 3.964 | 3.424 |
| 4.414999999999844 | 4.302 | 3.969 | 3.43 |
| 4.419999999999843 | 4.307 | 3.975 | 3.436 |
| 4.424999999999843 | 4.312 | 3.98 | 3.443 |
| 4.429999999999843 | 4.318 | 3.986 | 3.449 |
| 4.434999999999843 | 4.323 | 3.991 | 3.455 |
| 4.439999999999843 | 4.328 | 3.997 | 3.461 |
| 4.444999999999843 | 4.333 | 4.002 | 3.467 |
| 4.449999999999842 | 4.338 | 4.008 | 3.473 |
| 4.454999999999843 | 4.343 | 4.013 | 3.479 |
| 4.459999999999842 | 4.348 | 4.019 | 3.485 |
| 4.464999999999843 | 4.353 | 4.024 | 3.491 |
| 4.469999999999842 | 4.359 | 4.03 | 3.497 |
| 4.474999999999842 | 4.364 | 4.035 | 3.503 |
| 4.479999999999842 | 4.369 | 4.041 | 3.509 |
| 4.484999999999842 | 4.374 | 4.046 | 3.515 |
| 4.489999999999842 | 4.379 | 4.052 | 3.521 |
| 4.494999999999842 | 4.384 | 4.057 | 3.527 |
| 4.499999999999841 | 4.389 | 4.062 | 3.533 |
| 4.504999999999842 | 4.394 | 4.068 | 3.539 |
| 4.509999999999841 | 4.4 | 4.073 | 3.545 |
| 4.514999999999842 | 4.405 | 4.079 | 3.551 |
| 4.519999999999841 | 4.41 | 4.084 | 3.557 |
| 4.524999999999841 | 4.415 | 4.09 | 3.563 |
| 4.529999999999841 | 4.42 | 4.095 | 3.569 |
| 4.534999999999841 | 4.425 | 4.101 | 3.575 |
| 4.53999999999984 | 4.43 | 4.106 | 3.581 |
| 4.544999999999841 | 4.435 | 4.112 | 3.587 |
| 4.54999999999984 | 4.441 | 4.117 | 3.593 |
| 4.554999999999841 | 4.446 | 4.123 | 3.599 |
| 4.55999999999984 | 4.451 | 4.128 | 3.605 |
| 4.564999999999841 | 4.456 | 4.134 | 3.611 |
| 4.56999999999984 | 4.461 | 4.139 | 3.617 |
| 4.57499999999984 | 4.466 | 4.144 | 3.623 |
| 4.57999999999984 | 4.471 | 4.15 | 3.629 |
| 4.58499999999984 | 4.476 | 4.155 | 3.635 |
| 4.58999999999984 | 4.481 | 4.161 | 3.641 |
| 4.59499999999984 | 4.487 | 4.166 | 3.647 |
| 4.59999999999984 | 4.492 | 4.172 | 3.653 |
| 4.60499999999984 | 4.497 | 4.177 | 3.659 |
| 4.60999999999984 | 4.502 | 4.183 | 3.665 |
| 4.614999999999839 | 4.507 | 4.188 | 3.671 |
| 4.61999999999984 | 4.512 | 4.194 | 3.677 |
| 4.624999999999839 | 4.517 | 4.199 | 3.682 |
| 4.62999999999984 | 4.522 | 4.204 | 3.688 |
| 4.634999999999839 | 4.528 | 4.21 | 3.694 |
| 4.639999999999838 | 4.533 | 4.215 | 3.7 |
| 4.644999999999839 | 4.538 | 4.221 | 3.706 |
| 4.649999999999838 | 4.543 | 4.226 | 3.712 |
| 4.654999999999839 | 4.548 | 4.232 | 3.718 |
| 4.659999999999838 | 4.553 | 4.237 | 3.724 |
| 4.664999999999838 | 4.558 | 4.243 | 3.73 |
| 4.669999999999838 | 4.563 | 4.248 | 3.736 |
| 4.674999999999838 | 4.568 | 4.253 | 3.742 |
| 4.679999999999837 | 4.574 | 4.259 | 3.748 |
| 4.684999999999838 | 4.579 | 4.264 | 3.754 |
| 4.689999999999837 | 4.584 | 4.27 | 3.76 |
| 4.694999999999838 | 4.589 | 4.275 | 3.766 |
| 4.699999999999837 | 4.594 | 4.281 | 3.772 |
| 4.704999999999837 | 4.599 | 4.286 | 3.778 |
| 4.709999999999837 | 4.604 | 4.291 | 3.784 |
| 4.714999999999837 | 4.609 | 4.297 | 3.789 |
| 4.719999999999837 | 4.614 | 4.302 | 3.795 |
| 4.724999999999837 | 4.62 | 4.308 | 3.801 |
| 4.729999999999836 | 4.625 | 4.313 | 3.807 |
| 4.734999999999836 | 4.63 | 4.319 | 3.813 |
| 4.739999999999836 | 4.635 | 4.324 | 3.819 |
| 4.744999999999836 | 4.64 | 4.329 | 3.825 |
| 4.749999999999836 | 4.645 | 4.335 | 3.831 |
| 4.754999999999836 | 4.65 | 4.34 | 3.837 |
| 4.759999999999836 | 4.655 | 4.346 | 3.843 |
| 4.764999999999836 | 4.66 | 4.351 | 3.849 |
| 4.769999999999836 | 4.666 | 4.357 | 3.855 |
| 4.774999999999835 | 4.671 | 4.362 | 3.86 |
| 4.779999999999835 | 4.676 | 4.367 | 3.866 |
| 4.784999999999835 | 4.681 | 4.373 | 3.872 |
| 4.789999999999835 | 4.686 | 4.378 | 3.878 |
| 4.794999999999835 | 4.691 | 4.384 | 3.884 |
| 4.799999999999835 | 4.696 | 4.389 | 3.89 |
| 4.804999999999835 | 4.701 | 4.394 | 3.896 |
| 4.809999999999835 | 4.706 | 4.4 | 3.902 |
| 4.814999999999835 | 4.712 | 4.405 | 3.908 |
| 4.819999999999835 | 4.717 | 4.411 | 3.914 |
| 4.824999999999835 | 4.722 | 4.416 | 3.919 |
| 4.829999999999834 | 4.727 | 4.422 | 3.925 |
| 4.834999999999834 | 4.732 | 4.427 | 3.931 |
| 4.839999999999834 | 4.737 | 4.432 | 3.937 |
| 4.844999999999834 | 4.742 | 4.438 | 3.943 |
| 4.849999999999834 | 4.747 | 4.443 | 3.949 |
| 4.854999999999834 | 4.752 | 4.449 | 3.955 |
| 4.859999999999834 | 4.757 | 4.454 | 3.961 |
| 4.864999999999834 | 4.763 | 4.459 | 3.966 |
| 4.869999999999834 | 4.768 | 4.465 | 3.972 |
| 4.874999999999834 | 4.773 | 4.47 | 3.978 |
| 4.879999999999833 | 4.778 | 4.476 | 3.984 |
| 4.884999999999834 | 4.783 | 4.481 | 3.99 |
| 4.889999999999833 | 4.788 | 4.486 | 3.996 |
| 4.894999999999833 | 4.793 | 4.492 | 4.002 |
| 4.899999999999833 | 4.798 | 4.497 | 4.008 |
| 4.904999999999833 | 4.803 | 4.503 | 4.013 |
| 4.909999999999833 | 4.809 | 4.508 | 4.019 |
| 4.914999999999833 | 4.814 | 4.513 | 4.025 |
| 4.919999999999832 | 4.819 | 4.519 | 4.031 |
| 4.924999999999833 | 4.824 | 4.524 | 4.037 |
| 4.929999999999832 | 4.829 | 4.53 | 4.043 |
| 4.934999999999832 | 4.834 | 4.535 | 4.049 |
| 4.939999999999832 | 4.839 | 4.54 | 4.054 |
| 4.944999999999832 | 4.844 | 4.546 | 4.06 |
| 4.949999999999832 | 4.849 | 4.551 | 4.066 |
| 4.954999999999832 | 4.854 | 4.557 | 4.072 |
| 4.959999999999832 | 4.86 | 4.562 | 4.078 |
| 4.964999999999832 | 4.865 | 4.567 | 4.084 |
| 4.969999999999831 | 4.87 | 4.573 | 4.089 |
| 4.974999999999831 | 4.875 | 4.578 | 4.095 |
| 4.97999999999983 | 4.88 | 4.584 | 4.101 |
| 4.984999999999831 | 4.885 | 4.589 | 4.107 |
| 4.98999999999983 | 4.89 | 4.594 | 4.113 |
| 4.994999999999831 | 4.895 | 4.6 | 4.119 |
| 4.99999999999983 | 4.9 | 4.605 | 4.124 |